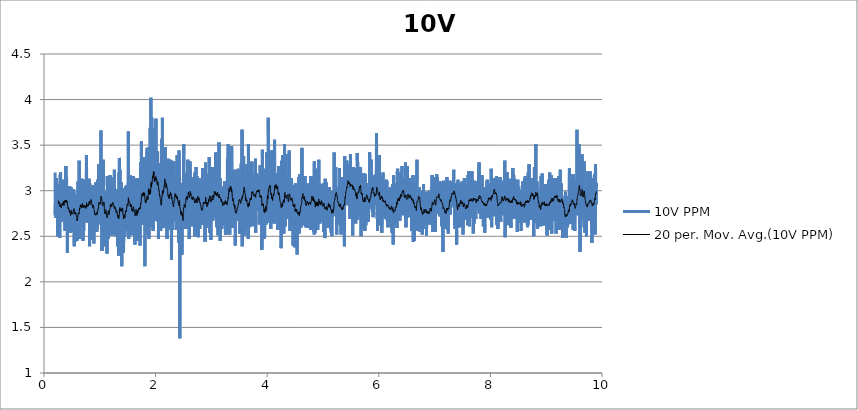
| Category | 10V PPM |
|---|---|
| 0.19886693011111112 | 3.2 |
| 0.20192682733333334 | 2.73 |
| 0.2049870023611111 | 2.91 |
| 0.20804745519444443 | 2.85 |
| 0.21110679683333333 | 2.85 |
| 0.21416724966666667 | 2.7 |
| 0.21722742469444445 | 3.07 |
| 0.22028732194444445 | 3.14 |
| 0.2233469413888889 | 2.85 |
| 0.22641044994444443 | 2.9 |
| 0.2294700693888889 | 2.89 |
| 0.23253246677777778 | 3.03 |
| 0.23559180841666666 | 3.03 |
| 0.23865226125 | 3 |
| 0.24171354744444443 | 2.76 |
| 0.24477511144444444 | 3.07 |
| 0.24783528647222222 | 2.5 |
| 0.2508951837222222 | 2.99 |
| 0.25395452536111107 | 2.68 |
| 0.2570135892222222 | 2.73 |
| 0.26007320866666667 | 2.61 |
| 0.2631325503333333 | 2.73 |
| 0.2661943921111111 | 2.82 |
| 0.2692537337777778 | 3.05 |
| 0.27231390880555556 | 2.73 |
| 0.27537352825 | 2.94 |
| 0.27843314769444444 | 2.87 |
| 0.2814924893333334 | 2.48 |
| 0.28455266438888893 | 2.74 |
| 0.2876125616111111 | 2.92 |
| 0.2906719032777778 | 3.18 |
| 0.2937318005 | 3 |
| 0.2967911421666667 | 3.2 |
| 0.29985048380555557 | 2.67 |
| 0.30291065883333335 | 2.74 |
| 0.30596972269444445 | 2.77 |
| 0.30902934213888894 | 2.83 |
| 0.31208951716666666 | 2.66 |
| 0.31514997 | 2.79 |
| 0.31820931163888894 | 2.99 |
| 0.32126948666666666 | 2.83 |
| 0.3243310506666667 | 3.05 |
| 0.32739039233333334 | 2.75 |
| 0.3304508451666667 | 2.71 |
| 0.33351018680555555 | 2.93 |
| 0.33657036183333333 | 2.84 |
| 0.33963025908333333 | 2.85 |
| 0.34269015630555555 | 2.78 |
| 0.3457494979722222 | 3.12 |
| 0.3488088396111111 | 2.97 |
| 0.3518684590555555 | 2.86 |
| 0.35493113425 | 2.68 |
| 0.3579918648611111 | 2.89 |
| 0.36105454002777776 | 3.06 |
| 0.3641138816944445 | 2.85 |
| 0.3671729455277778 | 3.01 |
| 0.37023423175 | 3.06 |
| 0.37329412897222225 | 2.85 |
| 0.3763543040277778 | 2.56 |
| 0.3794139234722222 | 2.93 |
| 0.3824732651111111 | 2.63 |
| 0.3855326067777778 | 3.07 |
| 0.3885922262222222 | 2.76 |
| 0.3916543458055555 | 3.27 |
| 0.3947172987777778 | 2.74 |
| 0.397777196 | 2.72 |
| 0.40083653766666666 | 2.72 |
| 0.40389671269444444 | 3.15 |
| 0.4069560543333333 | 2.76 |
| 0.41001595158333337 | 2.92 |
| 0.41307557102777775 | 2.76 |
| 0.4161349126666667 | 2.94 |
| 0.4191942543333333 | 2.32 |
| 0.42225359597222223 | 2.62 |
| 0.42531265983333333 | 2.74 |
| 0.4283728348611111 | 2.61 |
| 0.4314321765 | 3.01 |
| 0.4344929071388889 | 2.93 |
| 0.43755363774999995 | 2.69 |
| 0.44061325719444444 | 2.7 |
| 0.4436725988611111 | 2.79 |
| 0.4467333294722222 | 2.65 |
| 0.44979406008333334 | 2.7 |
| 0.45285673525 | 2.9 |
| 0.4559188548611111 | 2.67 |
| 0.45897847430555555 | 3.05 |
| 0.4620375381388889 | 2.64 |
| 0.4650977131944445 | 2.79 |
| 0.4681570548333333 | 2.66 |
| 0.4712166742777778 | 2.9 |
| 0.4742760159166667 | 2.54 |
| 0.47733702433333336 | 2.63 |
| 0.4803966437777778 | 2.91 |
| 0.4834557076388889 | 3.04 |
| 0.48651643827777774 | 2.82 |
| 0.48957605772222224 | 2.68 |
| 0.49263845508333337 | 2.57 |
| 0.49569779675000003 | 2.64 |
| 0.49875797177777775 | 2.61 |
| 0.501818424611111 | 2.94 |
| 0.5048774884444445 | 2.55 |
| 0.5079371078888889 | 2.85 |
| 0.5109967273333333 | 2.71 |
| 0.5140594025277777 | 2.84 |
| 0.5171195775555556 | 2.76 |
| 0.5201805859722223 | 2.94 |
| 0.5232404831944444 | 3.02 |
| 0.5263006582222222 | 2.73 |
| 0.5293650001666667 | 2.99 |
| 0.5324243418333333 | 2.75 |
| 0.5354839612777778 | 3 |
| 0.5385474698333333 | 2.67 |
| 0.5416334796666666 | 2.39 |
| 0.5446992105833334 | 2.7 |
| 0.5477854982222222 | 2.53 |
| 0.5508506735277778 | 2.81 |
| 0.5539430726388889 | 2.44 |
| 0.5570313048055556 | 2.83 |
| 0.5601245373055556 | 2.69 |
| 0.5631924905555555 | 2.68 |
| 0.5662665552777778 | 2.95 |
| 0.5693325639722222 | 2.76 |
| 0.5724041285277778 | 2.5 |
| 0.5755012501388889 | 2.55 |
| 0.5785925380555555 | 2.61 |
| 0.581674381 | 2.86 |
| 0.5847562239166666 | 2.67 |
| 0.5878377890833334 | 2.57 |
| 0.5909654679722222 | 2.45 |
| 0.5940453663333334 | 2.94 |
| 0.597158044388889 | 2.96 |
| 0.6002546103888888 | 2.64 |
| 0.6033367311111111 | 2.84 |
| 0.6063974617222222 | 2.88 |
| 0.6094598591111111 | 3.1 |
| 0.6125272567777778 | 2.81 |
| 0.6155924321111111 | 2.75 |
| 0.6186576074166666 | 2.77 |
| 0.6217266718611111 | 2.77 |
| 0.6248374053333334 | 2.78 |
| 0.6279003583055556 | 2.67 |
| 0.6309955353333333 | 3.33 |
| 0.6340801561944444 | 2.95 |
| 0.6371822780833333 | 2.47 |
| 0.6402649543888889 | 2.99 |
| 0.6433506864444444 | 2.69 |
| 0.6464211398333334 | 2.94 |
| 0.6494815926666667 | 2.99 |
| 0.6525448234444444 | 2.66 |
| 0.65563694475 | 2.63 |
| 0.6587329551388889 | 2.77 |
| 0.6618220207222223 | 3.02 |
| 0.664922753638889 | 2.83 |
| 0.6680304313888888 | 2.72 |
| 0.6711247750277778 | 2.75 |
| 0.6742055068055556 | 2.89 |
| 0.6773212405555556 | 2.85 |
| 0.6803928051388889 | 3.13 |
| 0.6834729813055554 | 2.94 |
| 0.6865473238333334 | 2.93 |
| 0.6896636131666667 | 2.76 |
| 0.6927585124166666 | 2.61 |
| 0.6958481335833334 | 2.75 |
| 0.6989230316666667 | 2.45 |
| 0.7020212644444443 | 2.9 |
| 0.7051172748611111 | 3.12 |
| 0.7082357865555555 | 3.07 |
| 0.7113220741944445 | 2.56 |
| 0.7144289185555556 | 2.88 |
| 0.717515484 | 2.73 |
| 0.720592326638889 | 2.82 |
| 0.7236666691388889 | 2.82 |
| 0.7267937924444444 | 2.72 |
| 0.7298784133333334 | 2.87 |
| 0.7329619230277777 | 3.02 |
| 0.7360540443333333 | 2.82 |
| 0.7391319981666667 | 2.7 |
| 0.7422268973888889 | 2.91 |
| 0.7453473536666667 | 2.78 |
| 0.7484591983055555 | 2.89 |
| 0.7515479860833333 | 2.69 |
| 0.75462010625 | 2.8 |
| 0.7576966711111112 | 2.73 |
| 0.7608229610277778 | 3.39 |
| 0.7639236939444445 | 3.05 |
| 0.7670022033611111 | 2.65 |
| 0.7701018250833334 | 2.7 |
| 0.773185057 | 2.8 |
| 0.7762805118333332 | 2.92 |
| 0.7793515208055556 | 2.67 |
| 0.7824464200555555 | 2.75 |
| 0.7855154844722222 | 2.74 |
| 0.7885989941666667 | 3.12 |
| 0.7917122278055556 | 2.78 |
| 0.7947790698888889 | 2.78 |
| 0.7978761914722222 | 3.02 |
| 0.8009730352777777 | 3.03 |
| 0.8040490445277778 | 2.75 |
| 0.8071425548055555 | 3.13 |
| 0.8102277312777778 | 3.05 |
| 0.8133287419722222 | 2.88 |
| 0.816398362 | 2.39 |
| 0.8195374304166666 | 3.08 |
| 0.8226112173333334 | 2.88 |
| 0.8257288956666666 | 2.86 |
| 0.8288093496388889 | 2.81 |
| 0.8318917481666667 | 2.82 |
| 0.8349780358055555 | 2.93 |
| 0.8380757129722223 | 3.04 |
| 0.8411572781111112 | 2.94 |
| 0.8442496772222222 | 2.94 |
| 0.8473142969444445 | 2.83 |
| 0.8504305863055556 | 2.67 |
| 0.8534943726388889 | 2.69 |
| 0.8565814936666667 | 2.46 |
| 0.859668336888889 | 2.85 |
| 0.8627351789722223 | 2.86 |
| 0.8658550796388889 | 2.8 |
| 0.8689772026666667 | 2.71 |
| 0.8720890473055556 | 2.84 |
| 0.8752347828055554 | 2.94 |
| 0.8783266263055556 | 2.89 |
| 0.8814123583611111 | 2.86 |
| 0.8845005905555556 | 3.06 |
| 0.8875957675833334 | 2.76 |
| 0.890686222111111 | 2.61 |
| 0.8938089007222223 | 2.42 |
| 0.8968807430833333 | 2.77 |
| 0.8999498075277778 | 2.83 |
| 0.9030394286944444 | 2.55 |
| 0.9061582181666666 | 2.67 |
| 0.9092264492222223 | 2.59 |
| 0.9123082921666668 | 2.58 |
| 0.9154143031388888 | 2.71 |
| 0.9184883678611111 | 2.58 |
| 0.9215885451944444 | 2.73 |
| 0.9246912226388888 | 2.81 |
| 0.9277980670277778 | 2.73 |
| 0.930886577 | 3.09 |
| 0.9339914768055555 | 3 |
| 0.9371174889444444 | 2.89 |
| 0.9402112770000001 | 2.95 |
| 0.9433014537500001 | 2.94 |
| 0.9463766296388889 | 2.55 |
| 0.9494776403611112 | 2.73 |
| 0.9525483715555556 | 2.58 |
| 0.955660494 | 2.77 |
| 0.9587395590000001 | 3.07 |
| 0.9618450143888889 | 2.83 |
| 0.9649507475833333 | 3.12 |
| 0.9680978720277779 | 2.63 |
| 0.9711733257222221 | 2.63 |
| 0.9742793366944444 | 3.03 |
| 0.9773822919722222 | 2.78 |
| 0.9804944144166667 | 3.29 |
| 0.9835754239722222 | 3 |
| 0.9866461551666666 | 2.78 |
| 0.9897507771666667 | 2.81 |
| 0.992830953361111 | 2.89 |
| 0.9959241858333333 | 2.89 |
| 0.9990243631388889 | 3.03 |
| 1.00214704175 | 2.85 |
| 1.0052249955833332 | 2.73 |
| 1.00830517175 | 2.94 |
| 1.0113995154166666 | 2.72 |
| 1.0144983037777777 | 2.86 |
| 1.017640705722222 | 3.27 |
| 1.0207289379166666 | 3.66 |
| 1.0238666173888888 | 2.81 |
| 1.0269320705 | 2.72 |
| 1.0300378036944444 | 2.67 |
| 1.033111035027778 | 2.59 |
| 1.0361870442777779 | 2.82 |
| 1.0392491638888888 | 2.34 |
| 1.0423451743055556 | 2.74 |
| 1.0454497963055556 | 2.81 |
| 1.0485480290833333 | 2.64 |
| 1.0516265384999999 | 2.91 |
| 1.0547056035 | 2.7 |
| 1.0577927245 | 3.13 |
| 1.0608792899444444 | 3.34 |
| 1.063965022 | 2.93 |
| 1.0670271415833332 | 2.88 |
| 1.0701225964166665 | 2.71 |
| 1.0732069394722223 | 3 |
| 1.0762746149444444 | 2.67 |
| 1.0793378457222222 | 2.69 |
| 1.0824399675833334 | 2.55 |
| 1.0855276441944444 | 2.57 |
| 1.0886089315277778 | 2.52 |
| 1.0916713289166666 | 2.39 |
| 1.0947462270277777 | 2.86 |
| 1.0978136246944443 | 2.64 |
| 1.1008932452777778 | 2.98 |
| 1.1039684211666667 | 2.87 |
| 1.1070508196944444 | 2.9 |
| 1.1101315514444443 | 2.52 |
| 1.1132233949722223 | 2.53 |
| 1.1163016265833334 | 2.66 |
| 1.119371246611111 | 2.73 |
| 1.1224542007222222 | 2.94 |
| 1.1255313211666667 | 2.98 |
| 1.12861094175 | 2.31 |
| 1.1316802839722222 | 2.84 |
| 1.1347565710277778 | 3.16 |
| 1.1378181350277776 | 2.89 |
| 1.140880254611111 | 2.86 |
| 1.1439593196111113 | 2.85 |
| 1.147035051111111 | 2.74 |
| 1.1501207831388889 | 2.87 |
| 1.1531845695 | 2.47 |
| 1.1562569674444445 | 2.68 |
| 1.1593379769999999 | 2.52 |
| 1.1624320428611112 | 2.8 |
| 1.1655238863888888 | 2.64 |
| 1.1686096184166668 | 2.77 |
| 1.1717100735555555 | 3.11 |
| 1.1747805269444445 | 2.92 |
| 1.1778790375 | 2.84 |
| 1.1809906043611111 | 2.7 |
| 1.1840630023055556 | 3.17 |
| 1.187181236222222 | 3.12 |
| 1.1902728019444446 | 3.09 |
| 1.193349922388889 | 2.77 |
| 1.1964442660277779 | 2.94 |
| 1.1995169417777778 | 3.01 |
| 1.202609340888889 | 2.89 |
| 1.205674794 | 2.62 |
| 1.2087869164444445 | 2.94 |
| 1.2118723706944443 | 2.51 |
| 1.2149878266666665 | 2.52 |
| 1.2180688362222223 | 2.85 |
| 1.221159846361111 | 3.02 |
| 1.2242277996111113 | 2.82 |
| 1.2273135316666668 | 2.64 |
| 1.230384540638889 | 3.01 |
| 1.2334727728333335 | 3 |
| 1.2365646163333335 | 2.59 |
| 1.2396409034166667 | 2.79 |
| 1.2427574705555555 | 2.79 |
| 1.2458301463055554 | 2.86 |
| 1.2489411575833334 | 3.03 |
| 1.2520318899166667 | 3.15 |
| 1.2551540129166667 | 2.59 |
| 1.2582291888333335 | 2.68 |
| 1.261331032888889 | 3.23 |
| 1.2644112090833333 | 2.88 |
| 1.2674958299444445 | 2.51 |
| 1.2705651721666666 | 2.52 |
| 1.2736620159722223 | 2.65 |
| 1.2767280246666666 | 2.75 |
| 1.2798040339444443 | 2.59 |
| 1.2829222678611112 | 2.61 |
| 1.2860082776944446 | 2.92 |
| 1.2890842869722223 | 2.73 |
| 1.2921594628611113 | 2.5 |
| 1.2952726964722223 | 2.83 |
| 1.298343149861111 | 2.69 |
| 1.3014672174444444 | 2.81 |
| 1.3045429489166667 | 3.02 |
| 1.3076245140833334 | 2.74 |
| 1.3107460815 | 2.88 |
| 1.3138470921944445 | 2.59 |
| 1.3169714375833335 | 2.66 |
| 1.320040502 | 2.39 |
| 1.3231429016666667 | 2.95 |
| 1.3262311338611112 | 2.78 |
| 1.3293377004444444 | 2.93 |
| 1.332435377611111 | 2.44 |
| 1.3355527781388887 | 2.65 |
| 1.3386176756666666 | 2.29 |
| 1.3417203531388888 | 2.46 |
| 1.344793584472222 | 3.2 |
| 1.3478798721111112 | 2.94 |
| 1.3509781048611111 | 3.36 |
| 1.3540666148611111 | 3.33 |
| 1.3571706812777777 | 2.67 |
| 1.3602366899722222 | 3.23 |
| 1.3633360339166665 | 2.59 |
| 1.3664256550833334 | 2.85 |
| 1.3694986086111112 | 2.68 |
| 1.3725937856666666 | 2.67 |
| 1.3756906294444444 | 2.43 |
| 1.3787710834166667 | 2.69 |
| 1.3818587600277779 | 2.79 |
| 1.3849650488055556 | 2.74 |
| 1.388047725138889 | 3.09 |
| 1.3911151228055556 | 2.66 |
| 1.394288359861111 | 2.17 |
| 1.3973793699722223 | 2.9 |
| 1.4004445453055556 | 2.47 |
| 1.4035316663055555 | 2.76 |
| 1.4066210096666667 | 3.03 |
| 1.4096884073611111 | 3 |
| 1.4127824731944445 | 2.84 |
| 1.4158532043888887 | 2.54 |
| 1.418921157638889 | 2.64 |
| 1.4220007782500002 | 2.92 |
| 1.425072065027778 | 2.32 |
| 1.4281464075277779 | 2.5 |
| 1.431253251888889 | 2.68 |
| 1.4343262054444443 | 2.86 |
| 1.4374024925000002 | 2.91 |
| 1.440478223972222 | 2.89 |
| 1.4435742343888889 | 2.85 |
| 1.4466644111388889 | 2.64 |
| 1.44974264275 | 2.5 |
| 1.452838375388889 | 2.96 |
| 1.455916607 | 2.96 |
| 1.4590467860277778 | 2.88 |
| 1.4621330736666667 | 2.68 |
| 1.465206305 | 3.03 |
| 1.4682934260277776 | 2.76 |
| 1.4713852695277778 | 3.05 |
| 1.4744832245000001 | 2.76 |
| 1.4775917356388888 | 2.93 |
| 1.4806799678333333 | 3.06 |
| 1.483746532111111 | 2.99 |
| 1.4868439315000002 | 3.02 |
| 1.4899341082500002 | 2.56 |
| 1.4930653984722222 | 2.77 |
| 1.4961619644722222 | 2.93 |
| 1.4992382515277778 | 2.66 |
| 1.5023100938888887 | 2.88 |
| 1.5054116601944445 | 2.76 |
| 1.5085021147222222 | 3.09 |
| 1.5115950694166669 | 3.65 |
| 1.5147141366944445 | 2.87 |
| 1.5178090359444445 | 2.47 |
| 1.5208731000833333 | 2.77 |
| 1.5239343862777777 | 2.75 |
| 1.5270276187777778 | 2.85 |
| 1.5301055725833335 | 2.6 |
| 1.5331907490555556 | 2.96 |
| 1.5362659249444444 | 2.8 |
| 1.5393522125833334 | 2.82 |
| 1.5424365556666668 | 2.75 |
| 1.5455278435833333 | 2.51 |
| 1.5486205204722223 | 3.17 |
| 1.5517145863333333 | 3.04 |
| 1.5547972626666668 | 2.64 |
| 1.557897717777778 | 2.78 |
| 1.5609987284722222 | 2.69 |
| 1.5641039060833333 | 2.87 |
| 1.5671899159166667 | 2.84 |
| 1.5702659251944444 | 2.85 |
| 1.5733561019444444 | 2.83 |
| 1.5764282220833332 | 2.59 |
| 1.5794978421111112 | 2.86 |
| 1.58257940725 | 2.67 |
| 1.5856448603611113 | 2.55 |
| 1.5887267033055557 | 2.63 |
| 1.5918143799166666 | 2.99 |
| 1.5949223354444444 | 3.12 |
| 1.5980005670833333 | 3.16 |
| 1.6011054668888889 | 2.94 |
| 1.604198699361111 | 2.62 |
| 1.6072860981666668 | 2.51 |
| 1.6103690522777778 | 2.64 |
| 1.6134550621388888 | 2.6 |
| 1.6165474612222221 | 2.87 |
| 1.6196565279444444 | 2.65 |
| 1.6227519827777777 | 2.64 |
| 1.6258838285833335 | 2.67 |
| 1.6290045626388887 | 2.41 |
| 1.6320983506944446 | 2.53 |
| 1.6352026949166667 | 3.01 |
| 1.6383017610555557 | 2.92 |
| 1.6414197171666667 | 3.14 |
| 1.6444871148333333 | 2.64 |
| 1.6475761804166666 | 2.76 |
| 1.6506596901111112 | 3.13 |
| 1.6537607008055557 | 2.56 |
| 1.6568328209722223 | 2.67 |
| 1.6599304981666667 | 2.67 |
| 1.6630278975277777 | 2.89 |
| 1.666146687027778 | 2.71 |
| 1.6692385305555555 | 2.55 |
| 1.672313428638889 | 3.14 |
| 1.6753886045277777 | 3.06 |
| 1.678481837 | 2.61 |
| 1.6815581240833333 | 2.45 |
| 1.68463830025 | 2.59 |
| 1.6877140317222223 | 2.85 |
| 1.69077892925 | 2.88 |
| 1.6938599388055557 | 2.92 |
| 1.6969259475 | 2.72 |
| 1.7000069570555554 | 3.02 |
| 1.7030707434166668 | 3.13 |
| 1.706159808972222 | 2.74 |
| 1.7092310957777777 | 2.96 |
| 1.7123112719444444 | 2.75 |
| 1.7153917259166667 | 2.91 |
| 1.7184599569722223 | 2.74 |
| 1.721522632138889 | 2.4 |
| 1.7245878074444443 | 3.01 |
| 1.7276524271944445 | 3.07 |
| 1.7307212138055554 | 3.31 |
| 1.733792778388889 | 3.14 |
| 1.7368604538611112 | 2.98 |
| 1.7399556308888888 | 2.92 |
| 1.7430208061944445 | 2.66 |
| 1.74610653825 | 3.54 |
| 1.7491969928055555 | 2.86 |
| 1.7522691129444443 | 3.17 |
| 1.7553515114722222 | 3.02 |
| 1.7584358545555556 | 3.12 |
| 1.7615124194166667 | 2.67 |
| 1.7645925955833335 | 2.88 |
| 1.7676633267777777 | 3.05 |
| 1.7707593371944443 | 2.75 |
| 1.7738392355833335 | 2.9 |
| 1.7769285789444444 | 2.63 |
| 1.7800070883611112 | 2.84 |
| 1.783071985888889 | 2.81 |
| 1.7861354944444443 | 3.37 |
| 1.7892012253611111 | 3.06 |
| 1.7922739010833333 | 2.68 |
| 1.7953504659444444 | 3.01 |
| 1.7984164746666667 | 2.93 |
| 1.8014963730277778 | 3.2 |
| 1.804564881888889 | 2.92 |
| 1.8076428356944443 | 2.17 |
| 1.8107169004166668 | 2.5 |
| 1.81378540925 | 3 |
| 1.8168614185277778 | 2.94 |
| 1.8199424280833334 | 2.99 |
| 1.823045383361111 | 2.66 |
| 1.8261122254166666 | 3.29 |
| 1.8291804564722223 | 3.28 |
| 1.8322798004166667 | 2.8 |
| 1.8353630323333332 | 2.52 |
| 1.8384720990277779 | 3.25 |
| 1.8415397745000002 | 2.69 |
| 1.8446002273333335 | 3.42 |
| 1.8476640136666667 | 3.47 |
| 1.8507525236666666 | 2.66 |
| 1.8538276995555556 | 2.63 |
| 1.856894541638889 | 3.07 |
| 1.8599713842777779 | 2.57 |
| 1.8630537828055556 | 3.31 |
| 1.8661431261666666 | 3.43 |
| 1.8692077459166667 | 2.93 |
| 1.8722773659166667 | 3.48 |
| 1.8753539307777778 | 2.97 |
| 1.8784602195555555 | 2.54 |
| 1.8815562299722224 | 2.47 |
| 1.8846269611666666 | 3.28 |
| 1.8877157489444443 | 2.74 |
| 1.8907931471944444 | 2.91 |
| 1.8938961024444443 | 3.1 |
| 1.897002669027778 | 2.6 |
| 1.90008951225 | 3.04 |
| 1.9031671882777779 | 3.69 |
| 1.9062429197500002 | 2.78 |
| 1.9093080950833334 | 3.21 |
| 1.9123896602222223 | 3.39 |
| 1.9154531687777778 | 4.02 |
| 1.9185450122777776 | 3.24 |
| 1.9216160212777778 | 2.82 |
| 1.9246953640555555 | 2.85 |
| 1.9277841518333334 | 2.72 |
| 1.9308807178333334 | 3.8 |
| 1.9339589494722222 | 3.38 |
| 1.9370544042777778 | 3 |
| 1.9401304135555557 | 2.98 |
| 1.943241702638889 | 3.24 |
| 1.9463266013055556 | 3.2 |
| 1.949412611138889 | 2.85 |
| 1.9524919539444443 | 3.38 |
| 1.9555671298333333 | 2.56 |
| 1.9586367498333335 | 3.68 |
| 1.9617166482222224 | 3.37 |
| 1.9647865460277778 | 2.88 |
| 1.967851999138889 | 3.48 |
| 1.970927175027778 | 3.26 |
| 1.9740087401666668 | 2.91 |
| 1.9770822493055558 | 2.69 |
| 1.9801527026944445 | 2.88 |
| 1.9832214893333333 | 3.14 |
| 1.9863250001944446 | 2.93 |
| 1.9894007316666666 | 3.19 |
| 1.9924734074166668 | 3.24 |
| 1.9955477499166667 | 3.38 |
| 1.9986232036111111 | 3.27 |
| 2.001713380361111 | 3.01 |
| 2.0048016125555557 | 3.79 |
| 2.0078862334166665 | 3.05 |
| 2.0109577979999997 | 2.67 |
| 2.0140332516666666 | 3.01 |
| 2.017102316111111 | 2.79 |
| 2.0202011044444443 | 3.4 |
| 2.023268502111111 | 2.73 |
| 2.026382569111111 | 3.03 |
| 2.0294613563333335 | 2.93 |
| 2.032544866027778 | 3.26 |
| 2.0356219864722225 | 3.43 |
| 2.038722719388889 | 2.88 |
| 2.0418051179166667 | 2.66 |
| 2.04487834925 | 3 |
| 2.0479404688333336 | 2.9 |
| 2.0510250896944444 | 2.47 |
| 2.0540958208888886 | 2.75 |
| 2.0571846086666667 | 3.22 |
| 2.0602761743888887 | 3.3 |
| 2.0633577395277776 | 2.68 |
| 2.0664345821944443 | 3.14 |
| 2.06950281325 | 2.71 |
| 2.072577989138889 | 2.87 |
| 2.0756414976944444 | 2.81 |
| 2.07873528575 | 2.72 |
| 2.081822128972222 | 2.71 |
| 2.0848859153333335 | 2.62 |
| 2.087960257833333 | 2.96 |
| 2.0910265443333333 | 2.56 |
| 2.094113943138889 | 3.26 |
| 2.097188007861111 | 2.71 |
| 2.1002873518055556 | 2.76 |
| 2.1033722504722223 | 2.89 |
| 2.1064477041388887 | 3.2 |
| 2.109523435611111 | 3.57 |
| 2.112586666388889 | 3.09 |
| 2.115672120638889 | 3.09 |
| 2.1187459075555557 | 3.2 |
| 2.121831639611111 | 3.8 |
| 2.1249045931388886 | 3.38 |
| 2.12798421375 | 2.59 |
| 2.1310621675555557 | 2.62 |
| 2.1341523443055554 | 2.76 |
| 2.137246687972222 | 3.2 |
| 2.140361032777778 | 2.91 |
| 2.143458987722222 | 2.59 |
| 2.146523051888889 | 3.14 |
| 2.149596283222222 | 3.33 |
| 2.1527070166944444 | 3.06 |
| 2.155771358638889 | 3.17 |
| 2.1588587574444444 | 3.41 |
| 2.161950045361111 | 3.1 |
| 2.16504744475 | 3.39 |
| 2.1681276209166667 | 2.8 |
| 2.1712241869166666 | 3.48 |
| 2.1742860287222223 | 2.93 |
| 2.1773712051944445 | 2.93 |
| 2.180441380777778 | 3.27 |
| 2.18352655725 | 2.82 |
| 2.1865986774166664 | 3.08 |
| 2.189699965888889 | 3.05 |
| 2.1927704193055555 | 2.68 |
| 2.195841428277778 | 3.19 |
| 2.1989235490277776 | 2.62 |
| 2.2020153925277777 | 2.68 |
| 2.205090290611111 | 2.47 |
| 2.208169633416667 | 3.12 |
| 2.2112439759166667 | 3.07 |
| 2.2143235965277777 | 3.01 |
| 2.2174043282777776 | 2.68 |
| 2.2204922826666667 | 2.61 |
| 2.2235616248888888 | 2.92 |
| 2.22664763475 | 3.35 |
| 2.2297317000277777 | 3.02 |
| 2.232809653861111 | 3.07 |
| 2.2358742735833332 | 3.02 |
| 2.238956672111111 | 2.95 |
| 2.2420221252222223 | 2.81 |
| 2.2450911896666668 | 2.98 |
| 2.2481580317222223 | 3.25 |
| 2.251232652027778 | 3.02 |
| 2.2543147727777777 | 3.34 |
| 2.25738105925 | 2.97 |
| 2.2604573463333333 | 2.87 |
| 2.2635302998611113 | 2.57 |
| 2.266604642361111 | 2.99 |
| 2.2696948191111113 | 3.04 |
| 2.2727724951666666 | 2.88 |
| 2.275835448111111 | 2.67 |
| 2.2789211801666664 | 2.74 |
| 2.2819846887222224 | 2.65 |
| 2.2850612535833332 | 2.24 |
| 2.2881322625833334 | 3.14 |
| 2.2911982712777776 | 3.33 |
| 2.294264002166667 | 2.77 |
| 2.2973625127222226 | 2.8 |
| 2.3004335217222223 | 2.76 |
| 2.3035148090833335 | 2.57 |
| 2.3066019300833336 | 2.7 |
| 2.309665994222222 | 3.08 |
| 2.3127342252777776 | 2.87 |
| 2.3158246798333333 | 2.92 |
| 2.3189101340833336 | 2.92 |
| 2.3219930881944446 | 2.85 |
| 2.3250635415833334 | 3.15 |
| 2.3281717749166666 | 3.14 |
| 2.3312350056944444 | 3.32 |
| 2.334300181 | 3.3 |
| 2.3373834129166666 | 2.67 |
| 2.3404744230277776 | 2.85 |
| 2.343560710666667 | 3.18 |
| 2.346642275833333 | 3 |
| 2.349716340527778 | 3.08 |
| 2.35279040525 | 2.78 |
| 2.3558747483333335 | 3.05 |
| 2.3589549245 | 2.78 |
| 2.362031489361111 | 2.72 |
| 2.365106109666667 | 2.66 |
| 2.3681748963055558 | 2.76 |
| 2.3712384048611113 | 2.57 |
| 2.374315803111111 | 2.74 |
| 2.3774045908888892 | 2.76 |
| 2.3804717107499997 | 3.15 |
| 2.383542441944445 | 2.67 |
| 2.3866098396111113 | 3.39 |
| 2.389689738 | 3.28 |
| 2.39279269325 | 3.08 |
| 2.395885092361111 | 2.73 |
| 2.398968046472222 | 2.57 |
| 2.4020598899722225 | 2.89 |
| 2.4051631230277777 | 2.7 |
| 2.4082296873055555 | 3.14 |
| 2.411326531111111 | 2.93 |
| 2.4144219859444447 | 2.43 |
| 2.4175196631111113 | 2.71 |
| 2.4205953945833336 | 3.44 |
| 2.423680848833333 | 2.66 |
| 2.4267610250277776 | 2.86 |
| 2.429846201472222 | 3.14 |
| 2.432918599444444 | 1.38 |
| 2.4360007201666667 | 2.57 |
| 2.439064506527778 | 2.46 |
| 2.4421369044722225 | 2.89 |
| 2.445218469611111 | 2.75 |
| 2.4482917009444445 | 2.67 |
| 2.451372432722222 | 2.84 |
| 2.4544587203333332 | 3.05 |
| 2.4575286181666667 | 2.82 |
| 2.4606421295833334 | 3.08 |
| 2.4637109162222224 | 2.68 |
| 2.466793314722222 | 2.95 |
| 2.4699079373333337 | 2.84 |
| 2.4729972806944445 | 2.3 |
| 2.476090235388889 | 2.71 |
| 2.4792006910555555 | 2.87 |
| 2.482281700611111 | 2.65 |
| 2.4853546541666667 | 2.58 |
| 2.488442052972222 | 2.78 |
| 2.491521673555556 | 2.62 |
| 2.4946196285277775 | 2.89 |
| 2.497694248833333 | 2.86 |
| 2.500762757666667 | 2.85 |
| 2.5038612682222223 | 3.51 |
| 2.5069294992777778 | 2.81 |
| 2.5099955079722225 | 2.98 |
| 2.513065128 | 3.14 |
| 2.516138914916667 | 2.97 |
| 2.5192340919444445 | 2.77 |
| 2.5223234353333335 | 2.75 |
| 2.5253983334166668 | 2.58 |
| 2.528473787111111 | 2.84 |
| 2.5315342399166667 | 3 |
| 2.5346016375833336 | 2.9 |
| 2.537677646861111 | 3.04 |
| 2.540761712138889 | 2.88 |
| 2.543851611111111 | 3.19 |
| 2.546930953888889 | 3.02 |
| 2.5500197416666666 | 2.73 |
| 2.5530957509444443 | 3.03 |
| 2.5561764827222224 | 2.85 |
| 2.559242769194445 | 2.58 |
| 2.5623162783333333 | 2.85 |
| 2.5653925653888887 | 3.13 |
| 2.568464963361111 | 3.15 |
| 2.5715548623055553 | 3.22 |
| 2.574622259972222 | 2.95 |
| 2.5777066030555553 | 3.34 |
| 2.5807845568888887 | 2.96 |
| 2.583858343805556 | 3.13 |
| 2.5869468537777776 | 2.88 |
| 2.5900125846944446 | 2.81 |
| 2.5931027614444444 | 2.68 |
| 2.5961809930555555 | 3 |
| 2.599263947166667 | 2.87 |
| 2.6023291224999996 | 2.47 |
| 2.605440133777778 | 3.02 |
| 2.6085105871666667 | 2.83 |
| 2.611595208027778 | 3.07 |
| 2.6146639946666665 | 3.15 |
| 2.617758616111111 | 3.32 |
| 2.6208379589166664 | 3.06 |
| 2.6239156349444444 | 2.78 |
| 2.627001367 | 2.88 |
| 2.6300893213888887 | 2.87 |
| 2.6331589414166667 | 2.95 |
| 2.6362530072777774 | 3.11 |
| 2.639313460111111 | 2.87 |
| 2.642395580833333 | 2.88 |
| 2.645461867333333 | 2.82 |
| 2.648534543083333 | 2.92 |
| 2.6516222196666663 | 2.61 |
| 2.6546837836666666 | 2.77 |
| 2.657769237944444 | 2.83 |
| 2.6608508030833335 | 2.86 |
| 2.663943479972222 | 2.9 |
| 2.6670233783611113 | 2.82 |
| 2.670114110694444 | 3.12 |
| 2.673199842722222 | 3.15 |
| 2.676292519638889 | 3.13 |
| 2.6793876966666668 | 2.96 |
| 2.6824753732777777 | 3.06 |
| 2.6855572161944443 | 2.83 |
| 2.688661838222222 | 2.63 |
| 2.6917753496388888 | 2.96 |
| 2.694850247722222 | 2.77 |
| 2.6979207011388886 | 2.5 |
| 2.700987821 | 3.09 |
| 2.7040607745555554 | 2.73 |
| 2.70714900675 | 3.2 |
| 2.710215293222222 | 2.51 |
| 2.713295747194444 | 2.81 |
| 2.716361755888889 | 2.78 |
| 2.719451099277778 | 2.97 |
| 2.7225284975000004 | 3.03 |
| 2.7256053401666667 | 3.26 |
| 2.7286766269444445 | 2.81 |
| 2.7317473581388887 | 2.83 |
| 2.73480808875 | 2.83 |
| 2.7379188222222224 | 2.8 |
| 2.741034833777778 | 3.16 |
| 2.7441433449166666 | 2.88 |
| 2.747219631972222 | 3.04 |
| 2.7502911965555557 | 3.04 |
| 2.7533897071111113 | 2.96 |
| 2.756494884722222 | 3.07 |
| 2.7596000623333334 | 3.01 |
| 2.762694405972222 | 2.49 |
| 2.765764303777778 | 2.91 |
| 2.7688450355555556 | 2.62 |
| 2.7719327121666666 | 2.93 |
| 2.7750340006388887 | 2.75 |
| 2.7781230662222223 | 2.86 |
| 2.7811943529999996 | 3.14 |
| 2.7842770293055557 | 2.7 |
| 2.7873616501944443 | 2.75 |
| 2.7904359926944444 | 2.58 |
| 2.7935606158611113 | 2.84 |
| 2.796669960388889 | 2.75 |
| 2.7997593037499997 | 2.96 |
| 2.802840591083333 | 2.72 |
| 2.8059238229999997 | 2.86 |
| 2.8090178888611113 | 2.88 |
| 2.8120822308055553 | 2.79 |
| 2.8151593512499997 | 2.71 |
| 2.8182378606666663 | 2.89 |
| 2.82132220375 | 2.73 |
| 2.824395990666667 | 2.71 |
| 2.827487556388889 | 2.73 |
| 2.830577455333333 | 2.63 |
| 2.833642352861111 | 2.67 |
| 2.8367197510833333 | 2.91 |
| 2.8398402073611115 | 2.88 |
| 2.842944273777778 | 3.25 |
| 2.846038895222222 | 3.03 |
| 2.8491129599444442 | 3.04 |
| 2.8522325828333335 | 2.96 |
| 2.855305536361111 | 2.87 |
| 2.85839349075 | 3.25 |
| 2.861468388861111 | 2.87 |
| 2.8645980123055557 | 2.65 |
| 2.867671243638889 | 2.63 |
| 2.8707528087777776 | 3.1 |
| 2.8738671535833333 | 2.94 |
| 2.8769628861944447 | 2.62 |
| 2.8800666748333335 | 2.76 |
| 2.88315462925 | 2.9 |
| 2.8862364721666665 | 2.44 |
| 2.88933026025 | 2.8 |
| 2.8924279374166666 | 2.95 |
| 2.895528948111111 | 3.31 |
| 2.898611902222222 | 3.26 |
| 2.901723191305556 | 2.7 |
| 2.9047947558611114 | 2.7 |
| 2.907884654833333 | 2.59 |
| 2.910947052194444 | 2.98 |
| 2.9140480629166667 | 2.63 |
| 2.917143795527778 | 2.82 |
| 2.9202231383333337 | 2.81 |
| 2.923334149611111 | 3.06 |
| 2.9264334935277776 | 3 |
| 2.9296003413333334 | 3.05 |
| 2.9326735726666664 | 2.92 |
| 2.935757360166667 | 2.64 |
| 2.9388847612777775 | 3.17 |
| 2.9419866053333332 | 2.64 |
| 2.9450806711944444 | 2.76 |
| 2.9481794595555555 | 2.94 |
| 2.951286026138889 | 3.19 |
| 2.9543725915555554 | 2.86 |
| 2.9574894365 | 2.96 |
| 2.9605829467777776 | 3.37 |
| 2.963699236138889 | 3.24 |
| 2.9667938575833332 | 2.86 |
| 2.969865144361111 | 2.98 |
| 2.972936431138889 | 2.54 |
| 2.9760171628888887 | 2.77 |
| 2.9790837271944444 | 2.61 |
| 2.9821630699722226 | 3.1 |
| 2.985249079805556 | 2.84 |
| 2.9883523128611107 | 2.68 |
| 2.9914224884722223 | 2.46 |
| 2.994539055611111 | 3.02 |
| 2.9976108979722222 | 3.02 |
| 3.0007027414999996 | 2.97 |
| 3.003789029138889 | 2.84 |
| 3.0068608715000003 | 3.05 |
| 3.009936602972222 | 3.19 |
| 3.0130248351666666 | 3.19 |
| 3.0161350130555555 | 3.26 |
| 3.0192338014166666 | 2.73 |
| 3.0223692585277777 | 3.2 |
| 3.025558885416667 | 2.67 |
| 3.028646006416667 | 2.95 |
| 3.0317181265833333 | 2.97 |
| 3.034796358194445 | 3.03 |
| 3.037865700416667 | 3.1 |
| 3.04094365425 | 2.7 |
| 3.044033553222222 | 2.78 |
| 3.0471345639166665 | 2.9 |
| 3.0502722433888887 | 3.21 |
| 3.053368809388889 | 3.08 |
| 3.0564948215 | 2.74 |
| 3.059591109722222 | 3.04 |
| 3.0626548960555557 | 2.8 |
| 3.065742294888889 | 3.12 |
| 3.0688274713333334 | 3.1 |
| 3.0718912576944444 | 2.73 |
| 3.0749694893055555 | 2.96 |
| 3.0780560547499998 | 3.42 |
| 3.0811492872222224 | 2.97 |
| 3.084241130722222 | 2.96 |
| 3.087318251166667 | 2.72 |
| 3.090425928916667 | 3.07 |
| 3.093496660111111 | 2.94 |
| 3.09656378 | 2.6 |
| 3.099644233972222 | 2.97 |
| 3.10274107775 | 2.97 |
| 3.105811253361111 | 3.24 |
| 3.1089111528888886 | 2.95 |
| 3.1119921624444444 | 3.31 |
| 3.115104840472222 | 2.62 |
| 3.1181805719444444 | 2.51 |
| 3.1212726932500003 | 3.08 |
| 3.1243464801666665 | 2.66 |
| 3.1274358235555555 | 2.81 |
| 3.130520722222222 | 3.01 |
| 3.1336175660000003 | 2.84 |
| 3.136706076 | 3.53 |
| 3.1398034753888893 | 3.11 |
| 3.1428789290555557 | 3 |
| 3.145951327027778 | 2.57 |
| 3.1490434483333334 | 2.86 |
| 3.152145014611111 | 2.84 |
| 3.1552529701388887 | 3.14 |
| 3.15831842325 | 2.45 |
| 3.161407766638889 | 2.85 |
| 3.164489609555556 | 2.94 |
| 3.167558951777778 | 2.92 |
| 3.170647739583333 | 2.87 |
| 3.173724304416667 | 3.01 |
| 3.1767944800277776 | 2.66 |
| 3.1799032689444444 | 2.96 |
| 3.1829837229166666 | 2.69 |
| 3.186068066 | 2.58 |
| 3.189137686027778 | 2.84 |
| 3.1922309185 | 3.05 |
| 3.195312205861111 | 2.62 |
| 3.198381270277778 | 3.03 |
| 3.201471447027778 | 2.89 |
| 3.2045469007222223 | 2.92 |
| 3.207630688194444 | 2.8 |
| 3.2107391993333336 | 3.02 |
| 3.213811041694444 | 2.94 |
| 3.2168970515555557 | 2.99 |
| 3.2199691716944447 | 2.84 |
| 3.2230485145000003 | 2.62 |
| 3.2261200790833335 | 2.93 |
| 3.229271926027778 | 2.92 |
| 3.2323434905833333 | 2.89 |
| 3.2354408899722222 | 2.77 |
| 3.2385077320555555 | 3.1 |
| 3.241600131138889 | 3.02 |
| 3.2446983639166667 | 2.89 |
| 3.247785762722222 | 2.74 |
| 3.2508778840277777 | 2.52 |
| 3.2539802836944443 | 2.71 |
| 3.257065182361111 | 3.02 |
| 3.2601675820277776 | 2.83 |
| 3.263269703916667 | 3.08 |
| 3.266339601722222 | 2.98 |
| 3.269411721888889 | 2.52 |
| 3.272492453638889 | 2.89 |
| 3.275603187111111 | 2.78 |
| 3.278714198388889 | 2.85 |
| 3.281791041055556 | 2.86 |
| 3.2849256647777776 | 2.8 |
| 3.2880233419722225 | 3.35 |
| 3.291133242055556 | 2.96 |
| 3.2942206408611114 | 3.15 |
| 3.297314984527778 | 3.14 |
| 3.3004162730277775 | 3.51 |
| 3.3035270065 | 2.77 |
| 3.306631072916667 | 3.34 |
| 3.30974875125 | 3.21 |
| 3.312843372694444 | 3.37 |
| 3.315993552888889 | 3.07 |
| 3.3191248430833338 | 2.7 |
| 3.3221944631111113 | 2.94 |
| 3.3253068633333336 | 3.03 |
| 3.3283762055555552 | 2.52 |
| 3.3314458255833332 | 2.89 |
| 3.33451794575 | 3.33 |
| 3.33760173325 | 2.8 |
| 3.3406763535277775 | 3.29 |
| 3.343762085583333 | 2.67 |
| 3.3468289276666665 | 2.69 |
| 3.3499079926666666 | 3.09 |
| 3.3529778904722223 | 3.27 |
| 3.3560477883055557 | 2.74 |
| 3.359113797 | 2.63 |
| 3.362215085472222 | 3.49 |
| 3.365298317388889 | 3.23 |
| 3.3683712709444444 | 2.77 |
| 3.371447558 | 2.71 |
| 3.374516066833333 | 2.59 |
| 3.3775937428611114 | 2.81 |
| 3.3806780859444445 | 2.83 |
| 3.3837838191388885 | 2.7 |
| 3.386858161666667 | 2.68 |
| 3.3899397268055553 | 3.03 |
| 3.3930165694444447 | 2.59 |
| 3.396097579 | 2.89 |
| 3.3991755328333335 | 2.74 |
| 3.402255431222222 | 2.67 |
| 3.4053394965000003 | 2.61 |
| 3.408452730138889 | 2.85 |
| 3.4115204055833335 | 2.94 |
| 3.4146197495277777 | 2.72 |
| 3.4176965921666667 | 2.71 |
| 3.4207623230833333 | 3.23 |
| 3.4238319431111113 | 2.98 |
| 3.4269448989166666 | 2.4 |
| 3.4300497987500003 | 2.53 |
| 3.4331208077222226 | 2.66 |
| 3.43619042775 | 2.74 |
| 3.439278104361111 | 2.68 |
| 3.4423752259444442 | 2.71 |
| 3.4454592912222224 | 2.99 |
| 3.4485300224166666 | 2.79 |
| 3.451597697888889 | 2.99 |
| 3.454661484222222 | 2.97 |
| 3.457763883888889 | 2.8 |
| 3.4608373930277776 | 2.79 |
| 3.463913957888889 | 3.14 |
| 3.4670016345000003 | 2.67 |
| 3.470066532 | 2.8 |
| 3.4731503195 | 3.1 |
| 3.476217439388889 | 2.84 |
| 3.479299004527778 | 3.21 |
| 3.482365846611111 | 3.24 |
| 3.4854312997222223 | 2.93 |
| 3.4885078645833336 | 3.02 |
| 3.4915947078055556 | 2.73 |
| 3.4946637722222222 | 2.83 |
| 3.497750059861111 | 2.76 |
| 3.5008110682777773 | 2.73 |
| 3.5039006894444444 | 2.85 |
| 3.5069853103055553 | 2.84 |
| 3.5100702089722224 | 2.53 |
| 3.513152051916667 | 2.74 |
| 3.5162236164999996 | 2.99 |
| 3.5193026815 | 2.76 |
| 3.5223664678333333 | 2.87 |
| 3.52544497725 | 2.78 |
| 3.528513486111111 | 2.9 |
| 3.5315858840555556 | 3.24 |
| 3.5346546706944446 | 3.3 |
| 3.537718734833333 | 2.77 |
| 3.5407889104444443 | 3.05 |
| 3.5438554747222226 | 3.25 |
| 3.546928150472222 | 3.09 |
| 3.5500030485555554 | 3.67 |
| 3.5530662793333336 | 2.39 |
| 3.556141733 | 2.87 |
| 3.5592210758055556 | 3.21 |
| 3.562284862166667 | 2.91 |
| 3.5653711498055554 | 2.86 |
| 3.568439103055556 | 2.81 |
| 3.5715087230555556 | 2.99 |
| 3.5745919549722225 | 3.02 |
| 3.5776674086666667 | 3.38 |
| 3.5807523073333334 | 2.88 |
| 3.5838458175833336 | 3.08 |
| 3.5869757188333335 | 3.12 |
| 3.590062562055556 | 2.81 |
| 3.593176629055556 | 2.86 |
| 3.5962470824722224 | 2.94 |
| 3.5993267030555556 | 2.51 |
| 3.6023929895555558 | 2.8 |
| 3.60548455525 | 3.08 |
| 3.6085516751388886 | 2.6 |
| 3.611647963333333 | 2.67 |
| 3.6147448071388886 | 3 |
| 3.61784526225 | 2.93 |
| 3.620922104888889 | 2.63 |
| 3.62399866975 | 2.81 |
| 3.627078568138889 | 2.91 |
| 3.6301420766944448 | 2.78 |
| 3.633214196861111 | 2.93 |
| 3.6362843724722222 | 3.29 |
| 3.6393559370277777 | 2.71 |
| 3.64244278025 | 2.83 |
| 3.645517956138889 | 2.91 |
| 3.6485959099722223 | 2.75 |
| 3.6516669189722224 | 2.99 |
| 3.6548029316666666 | 2.6 |
| 3.6578831078333334 | 2.73 |
| 3.6610085643888888 | 2.47 |
| 3.6640937408333336 | 3.51 |
| 3.6672030853611113 | 2.94 |
| 3.67026548275 | 2.7 |
| 3.6733434365555553 | 2.94 |
| 3.6764194458333335 | 2.6 |
| 3.679506289055556 | 2.67 |
| 3.6825775758333332 | 3.12 |
| 3.6856624745 | 3.24 |
| 3.6887720968055557 | 2.94 |
| 3.6918356053611108 | 3.15 |
| 3.6949063365555554 | 3.29 |
| 3.6979773455555556 | 2.88 |
| 3.701061688611111 | 2.93 |
| 3.704155754472222 | 2.87 |
| 3.7072359306666667 | 2.98 |
| 3.710329163138889 | 2.82 |
| 3.7133973941944447 | 2.65 |
| 3.7164717366944444 | 2.99 |
| 3.7195405233333334 | 3.16 |
| 3.722614588055556 | 3.18 |
| 3.7256825413055554 | 3.32 |
| 3.7287588283611113 | 3.17 |
| 3.731824559277778 | 2.87 |
| 3.734889734583333 | 2.61 |
| 3.7379685218055556 | 2.86 |
| 3.7410367528333333 | 2.78 |
| 3.7441183180000004 | 2.92 |
| 3.747195994027778 | 3.05 |
| 3.750268391972222 | 2.98 |
| 3.753343567861111 | 3.05 |
| 3.7564379115277777 | 2.91 |
| 3.7595130874166665 | 2.72 |
| 3.7625813184444445 | 2.89 |
| 3.7656484383333333 | 2.9 |
| 3.7687261143611113 | 3.17 |
| 3.7718024014166667 | 2.91 |
| 3.7748720214444442 | 2.83 |
| 3.7779391413055556 | 2.98 |
| 3.781004872222222 | 2.98 |
| 3.784076992388889 | 3.19 |
| 3.787140778722222 | 2.92 |
| 3.7902045650833336 | 3.35 |
| 3.7932747406944443 | 2.54 |
| 3.796367973166667 | 3.19 |
| 3.7994398155277778 | 2.93 |
| 3.8025183249444443 | 3.15 |
| 3.8055954453888887 | 3.04 |
| 3.8086661765833334 | 3.19 |
| 3.8117616314166667 | 3.08 |
| 3.814842640972222 | 2.8 |
| 3.817960319277778 | 3 |
| 3.821069386 | 2.94 |
| 3.824158729361111 | 2.88 |
| 3.8272427946666667 | 3.05 |
| 3.830320192888889 | 2.78 |
| 3.833405369361111 | 2.92 |
| 3.83649804625 | 3.06 |
| 3.8395687774444442 | 3 |
| 3.8426445089166665 | 3.17 |
| 3.8457107954166667 | 2.98 |
| 3.8487959718888884 | 2.87 |
| 3.8519008716944443 | 3.13 |
| 3.854967435972222 | 3.04 |
| 3.8580453898055556 | 2.63 |
| 3.8611639015000003 | 2.8 |
| 3.864248522388889 | 2.95 |
| 3.867315086666667 | 2.64 |
| 3.8703780396388887 | 2.88 |
| 3.873440437027778 | 3.28 |
| 3.8765283914166666 | 2.91 |
| 3.8796119011111108 | 2.78 |
| 3.882676798638889 | 3.03 |
| 3.8857469742500004 | 2.85 |
| 3.8888207611666665 | 2.72 |
| 3.8918903811666667 | 3.02 |
| 3.8949750020555554 | 3.14 |
| 3.898060734111111 | 2.6 |
| 3.9011350766111113 | 2.62 |
| 3.9042155305833335 | 2.35 |
| 3.907290984277778 | 2.52 |
| 3.9103694936666664 | 2.76 |
| 3.913445225166667 | 3.45 |
| 3.9165265125 | 3.09 |
| 3.919614189111111 | 2.75 |
| 3.922691865138889 | 2.83 |
| 3.92577481925 | 2.78 |
| 3.928883330388889 | 2.75 |
| 3.9319507280555555 | 2.63 |
| 3.935042571555556 | 2.67 |
| 3.9381263590555555 | 2.72 |
| 3.9412054240555556 | 2.47 |
| 3.9442925450833335 | 2.61 |
| 3.9473624428888887 | 3.24 |
| 3.950429840555555 | 2.98 |
| 3.9535052942499997 | 2.49 |
| 3.956571580722222 | 2.83 |
| 3.9596520346944444 | 3.03 |
| 3.9627263772222223 | 2.79 |
| 3.965788774583334 | 2.91 |
| 3.9688589501944445 | 2.66 |
| 3.971937737416667 | 2.94 |
| 3.975004023888889 | 2.82 |
| 3.9780961451944443 | 2.63 |
| 3.9811635428611107 | 2.73 |
| 3.9842287181944442 | 2.85 |
| 3.9872958380555557 | 2.96 |
| 3.990371013944445 | 3.01 |
| 3.993448967777778 | 3.42 |
| 3.9965213657222223 | 3.18 |
| 3.9995970971944446 | 3.25 |
| 4.0026708841388885 | 3.16 |
| 4.005774394972222 | 3.11 |
| 4.008851237611111 | 2.72 |
| 4.01192002425 | 2.66 |
| 4.014988255305556 | 2.76 |
| 4.018056208555556 | 3.8 |
| 4.021153330138889 | 3.61 |
| 4.024235450888889 | 3.05 |
| 4.027301737388889 | 2.65 |
| 4.030378302222222 | 3.08 |
| 4.033461811944444 | 3.18 |
| 4.036545599416667 | 2.76 |
| 4.039617719583333 | 3.02 |
| 4.042700118111111 | 2.75 |
| 4.045765849027778 | 2.92 |
| 4.048882138361111 | 2.87 |
| 4.051964814694444 | 3.3 |
| 4.05505860275 | 3.04 |
| 4.058127667194444 | 2.73 |
| 4.061208676750001 | 2.88 |
| 4.064296908944444 | 2.58 |
| 4.067385141138889 | 2.72 |
| 4.070457261277777 | 2.9 |
| 4.073529103666666 | 2.65 |
| 4.076602612777777 | 2.89 |
| 4.079673899555556 | 2.79 |
| 4.082742686194444 | 3.44 |
| 4.0858070281388885 | 3.12 |
| 4.088886370916667 | 2.97 |
| 4.09195960225 | 2.76 |
| 4.095030333444445 | 2.8 |
| 4.098103009194444 | 2.77 |
| 4.1011917969722225 | 3.35 |
| 4.104266972861111 | 3.38 |
| 4.107350760361111 | 3.03 |
| 4.1104364924166665 | 3.22 |
| 4.11351444625 | 2.85 |
| 4.116574899055555 | 3.1 |
| 4.119678132111111 | 2.87 |
| 4.122749974472223 | 3.21 |
| 4.1258501518055555 | 2.64 |
| 4.128923383138889 | 3.39 |
| 4.132016893416667 | 3.56 |
| 4.135086235638889 | 3 |
| 4.138161411527777 | 2.76 |
| 4.141232142722222 | 2.85 |
| 4.144313985638889 | 3.08 |
| 4.1473824944999995 | 2.97 |
| 4.150457948166667 | 2.89 |
| 4.153561181222223 | 3.13 |
| 4.156695249361111 | 2.92 |
| 4.159768480694445 | 3.18 |
| 4.162868935833333 | 3.05 |
| 4.165947723027778 | 3.13 |
| 4.169025954638889 | 3.09 |
| 4.172107242 | 2.77 |
| 4.175180751138889 | 2.9 |
| 4.178252871277778 | 3.09 |
| 4.181335547611111 | 3.19 |
| 4.184404612027778 | 3.03 |
| 4.187481176888888 | 2.98 |
| 4.190554963805556 | 2.57 |
| 4.193638473527778 | 2.84 |
| 4.196713093805555 | 2.88 |
| 4.199821604944445 | 2.59 |
| 4.20289150275 | 3.27 |
| 4.205967789833333 | 3 |
| 4.2090476881944445 | 2.71 |
| 4.212122030722222 | 3.25 |
| 4.215207207166666 | 2.82 |
| 4.218289605694444 | 2.73 |
| 4.221371170833334 | 2.81 |
| 4.224489960333333 | 2.66 |
| 4.227564580638889 | 2.75 |
| 4.230648645944445 | 2.81 |
| 4.233725766388889 | 2.63 |
| 4.2368131651944445 | 2.81 |
| 4.239891952388889 | 3.03 |
| 4.242960739027778 | 3 |
| 4.246073694861111 | 2.8 |
| 4.2491544266388885 | 2.37 |
| 4.252225991194445 | 2.67 |
| 4.255292833277778 | 2.86 |
| 4.258398566472222 | 3.33 |
| 4.261491798944444 | 2.83 |
| 4.264600865666667 | 2.86 |
| 4.267672708027778 | 2.78 |
| 4.2707484395 | 2.69 |
| 4.273839449638889 | 3.28 |
| 4.276915736694445 | 3.39 |
| 4.280005913444445 | 3.14 |
| 4.283076089055555 | 2.7 |
| 4.286185711361111 | 2.99 |
| 4.289260053861112 | 2.82 |
| 4.292329673888889 | 2.98 |
| 4.295418739472223 | 2.66 |
| 4.298510027388889 | 2.53 |
| 4.301575202694444 | 2.87 |
| 4.3046762133888885 | 2.85 |
| 4.307768890305556 | 3.12 |
| 4.310874067888889 | 3.51 |
| 4.313957577611111 | 3.23 |
| 4.317049698888889 | 3.07 |
| 4.320120430083334 | 2.93 |
| 4.323193661416666 | 2.61 |
| 4.326268559527778 | 2.62 |
| 4.329333457055555 | 2.78 |
| 4.332395854416666 | 2.75 |
| 4.335459640777778 | 3.4 |
| 4.338528983 | 2.74 |
| 4.341608047999999 | 3.1 |
| 4.34467600125 | 2.76 |
| 4.347758677583333 | 3.08 |
| 4.350844965222222 | 3.07 |
| 4.353934864166667 | 3.07 |
| 4.357016429305555 | 2.69 |
| 4.360081882416667 | 2.74 |
| 4.363161225222222 | 2.76 |
| 4.366235289944445 | 3.08 |
| 4.369343523277777 | 2.78 |
| 4.372439533694444 | 2.97 |
| 4.3755174875 | 2.8 |
| 4.378607942055556 | 2.94 |
| 4.381703119083333 | 2.85 |
| 4.384808018888889 | 3.01 |
| 4.387908196222223 | 2.95 |
| 4.391013373833333 | 3.07 |
| 4.394103272777778 | 3.44 |
| 4.397199838777778 | 3.11 |
| 4.400294738027778 | 2.97 |
| 4.403372691861112 | 2.91 |
| 4.406445089805556 | 2.56 |
| 4.409569157388889 | 2.79 |
| 4.412649333555556 | 2.96 |
| 4.4157500664722225 | 2.68 |
| 4.418824131166667 | 2.74 |
| 4.421929031 | 2.77 |
| 4.425019485527778 | 2.65 |
| 4.428131052388888 | 2.89 |
| 4.431215673277777 | 2.81 |
| 4.434305016638889 | 3.14 |
| 4.43740074925 | 3.1 |
| 4.440483425583333 | 3.03 |
| 4.443562768361111 | 2.64 |
| 4.446633777361111 | 3.02 |
| 4.449700341638889 | 2.69 |
| 4.4527852403055554 | 3 |
| 4.455900140694444 | 3.05 |
| 4.459006151666667 | 2.84 |
| 4.462071326999999 | 2.88 |
| 4.465170948722222 | 2.4 |
| 4.468255569611111 | 2.79 |
| 4.471341579444444 | 2.46 |
| 4.474427033694444 | 2.88 |
| 4.47751276575 | 2.67 |
| 4.480592386333333 | 2.78 |
| 4.48366617325 | 3 |
| 4.486778295722222 | 2.91 |
| 4.489850138083334 | 2.65 |
| 4.492916702361111 | 3.06 |
| 4.495999934277777 | 2.38 |
| 4.499122335083333 | 2.9 |
| 4.502216956527778 | 2.47 |
| 4.505281298472222 | 3.08 |
| 4.508361752444444 | 2.89 |
| 4.511448040083333 | 2.91 |
| 4.514540439166667 | 2.71 |
| 4.517621448722222 | 2.8 |
| 4.520717459138889 | 2.75 |
| 4.523822358944444 | 2.87 |
| 4.526891145583333 | 2.79 |
| 4.529991045111111 | 2.8 |
| 4.533070665694444 | 2.59 |
| 4.536177787861111 | 2.3 |
| 4.539269075777778 | 2.64 |
| 4.542368141944444 | 2.59 |
| 4.545456651916666 | 2.86 |
| 4.548547939833333 | 2.83 |
| 4.55162644925 | 2.8 |
| 4.554706903222223 | 2.89 |
| 4.557802635861111 | 2.77 |
| 4.560863366472222 | 2.62 |
| 4.563929097361111 | 2.69 |
| 4.567001495333333 | 3.15 |
| 4.5700811159166665 | 2.55 |
| 4.573164070027778 | 2.53 |
| 4.576255635750001 | 2.76 |
| 4.579349423805556 | 3.09 |
| 4.582433766888889 | 3.18 |
| 4.585540889055555 | 2.9 |
| 4.588625787722222 | 2.64 |
| 4.591704574916666 | 3.11 |
| 4.594776417305556 | 3.06 |
| 4.59785353775 | 2.87 |
| 4.60094454786111 | 2.66 |
| 4.60406417075 | 2.59 |
| 4.607156569833333 | 3.07 |
| 4.610228412222223 | 2.9 |
| 4.6133363677500006 | 3.04 |
| 4.616421822 | 3.02 |
| 4.619492553194444 | 2.98 |
| 4.622556617333333 | 3.47 |
| 4.625655127888889 | 3.08 |
| 4.628750304944444 | 2.97 |
| 4.631817980388889 | 2.67 |
| 4.634933714166666 | 2.95 |
| 4.638003889777778 | 3.13 |
| 4.641126012777778 | 2.99 |
| 4.644195910583333 | 2.69 |
| 4.647266364 | 2.82 |
| 4.650355985138888 | 2.62 |
| 4.653427549722222 | 2.99 |
| 4.656502447833333 | 2.63 |
| 4.659562067277778 | 3.07 |
| 4.66265529975 | 2.84 |
| 4.66572964225 | 2.83 |
| 4.668803706972223 | 2.79 |
| 4.671882216388888 | 2.66 |
| 4.6750387858055555 | 2.65 |
| 4.678162575611111 | 3.16 |
| 4.681306366527778 | 2.97 |
| 4.684404877083333 | 2.83 |
| 4.687510332472223 | 2.79 |
| 4.690622454916666 | 3 |
| 4.693687908027778 | 2.6 |
| 4.696789752111111 | 2.83 |
| 4.6998629834444445 | 2.94 |
| 4.702967605472222 | 3.02 |
| 4.706060004583334 | 2.96 |
| 4.709192128166667 | 3.07 |
| 4.712270637583333 | 2.98 |
| 4.715343035527778 | 2.89 |
| 4.718431545527777 | 2.83 |
| 4.7215014433333335 | 2.84 |
| 4.724598287138889 | 2.65 |
| 4.727715132055556 | 2.97 |
| 4.730779196222222 | 2.59 |
| 4.733858816805555 | 2.78 |
| 4.7369287146111105 | 2.61 |
| 4.74000555725 | 2.7 |
| 4.743075455083333 | 3.08 |
| 4.746176187972223 | 2.85 |
| 4.749247752555556 | 2.97 |
| 4.752375431444444 | 3.05 |
| 4.755471441861111 | 2.78 |
| 4.758538283944445 | 2.89 |
| 4.761636238916666 | 2.81 |
| 4.764740027555556 | 3.08 |
| 4.7678185369722215 | 3.08 |
| 4.7708831566944445 | 3.03 |
| 4.773944442888889 | 2.79 |
| 4.777020452166667 | 2.57 |
| 4.780102295111111 | 3.16 |
| 4.783199138888889 | 2.92 |
| 4.786273759194444 | 2.86 |
| 4.7893781034166665 | 3.09 |
| 4.792480503111111 | 2.65 |
| 4.795574013361111 | 3.13 |
| 4.798654467333334 | 3.05 |
| 4.801767423166667 | 2.98 |
| 4.804857599916667 | 2.58 |
| 4.807925275388889 | 2.72 |
| 4.810994895388889 | 2.83 |
| 4.814085627722223 | 2.84 |
| 4.817161359194444 | 3.05 |
| 4.820247924638888 | 3.11 |
| 4.823317266861111 | 3.15 |
| 4.826383553361111 | 2.88 |
| 4.8294842862500005 | 2.55 |
| 4.832584463583333 | 2.91 |
| 4.835725476583334 | 2.97 |
| 4.838792596444445 | 2.74 |
| 4.841892218166667 | 2.52 |
| 4.844986561833334 | 3.32 |
| 4.848060070944445 | 2.68 |
| 4.8511363580277775 | 2.74 |
| 4.854226534777778 | 2.77 |
| 4.85731754488889 | 2.91 |
| 4.860414110888889 | 2.54 |
| 4.863503176472222 | 2.59 |
| 4.866575574416666 | 3.24 |
| 4.86966630675 | 3.23 |
| 4.872739815888889 | 2.89 |
| 4.875821103250001 | 2.78 |
| 4.878889889888889 | 3.06 |
| 4.882007012611111 | 2.93 |
| 4.885075799250001 | 2.61 |
| 4.888171809666667 | 2.72 |
| 4.891253097 | 3.02 |
| 4.894331606416667 | 2.9 |
| 4.897399837472222 | 2.85 |
| 4.900473346611111 | 3.11 |
| 4.903539910888889 | 2.57 |
| 4.906605919583333 | 2.58 |
| 4.909718597611111 | 2.65 |
| 4.912802385111111 | 2.67 |
| 4.9159617325 | 3.24 |
| 4.919043575416667 | 2.79 |
| 4.922170698722223 | 2.98 |
| 4.92523559625 | 3.34 |
| 4.928354941333334 | 2.75 |
| 4.931446784861111 | 2.93 |
| 4.934516682666667 | 3.08 |
| 4.937596025444444 | 2.81 |
| 4.940658700638889 | 2.76 |
| 4.943753044277777 | 2.64 |
| 4.946834053833333 | 2.99 |
| 4.949948676416667 | 2.87 |
| 4.953013018361111 | 2.79 |
| 4.956085416333333 | 2.81 |
| 4.959159758833334 | 2.75 |
| 4.962244657499999 | 2.85 |
| 4.965326222638889 | 3.02 |
| 4.968417232777778 | 2.96 |
| 4.971485186027778 | 2.79 |
| 4.974580085277777 | 2.69 |
| 4.977648038527778 | 2.79 |
| 4.98072377 | 2.74 |
| 4.983830892166666 | 3.07 |
| 4.986947459305555 | 2.92 |
| 4.990058748361111 | 2.66 |
| 4.993126423833333 | 2.84 |
| 4.996225212194444 | 2.81 |
| 4.999289276333333 | 2.76 |
| 5.002387509083333 | 2.95 |
| 5.005482963916666 | 3.08 |
| 5.008580918888889 | 3.06 |
| 5.011650261111111 | 2.55 |
| 5.0147257148055555 | 2.8 |
| 5.017804224222222 | 3.08 |
| 5.020955237777778 | 2.56 |
| 5.024028746888889 | 2.66 |
| 5.0271178124722224 | 2.8 |
| 5.030192988361111 | 2.79 |
| 5.033278164833334 | 2.48 |
| 5.036344451305555 | 2.58 |
| 5.039422682944444 | 3.13 |
| 5.042490636194444 | 2.69 |
| 5.045557756055556 | 2.99 |
| 5.048633765333333 | 2.79 |
| 5.051724497666666 | 2.86 |
| 5.054799673555555 | 2.75 |
| 5.057871238138889 | 3.09 |
| 5.0609389136111105 | 2.91 |
| 5.064024923444444 | 2.69 |
| 5.067103155055555 | 2.59 |
| 5.070177219777778 | 2.88 |
| 5.073245728611111 | 2.88 |
| 5.07632396025 | 3.04 |
| 5.079404414194444 | 2.92 |
| 5.082486812722222 | 2.72 |
| 5.0855583773055555 | 2.74 |
| 5.0886254971666665 | 2.82 |
| 5.091718729666667 | 3.04 |
| 5.094789183055555 | 2.93 |
| 5.097868803638889 | 2.79 |
| 5.100937034694445 | 2.67 |
| 5.104008321472222 | 2.66 |
| 5.107089053222222 | 2.6 |
| 5.110187841583333 | 3.04 |
| 5.113248294416667 | 3.05 |
| 5.116337915583333 | 2.99 |
| 5.1194078133888885 | 2.59 |
| 5.122503823805556 | 2.83 |
| 5.125590389222222 | 2.92 |
| 5.128673343333333 | 2.71 |
| 5.1317632423055555 | 2.72 |
| 5.134838973777778 | 2.64 |
| 5.137916371999999 | 2.57 |
| 5.141002937444445 | 2.92 |
| 5.144074779805556 | 2.71 |
| 5.147140510722222 | 2.54 |
| 5.150213742055556 | 2.85 |
| 5.153279472944444 | 2.82 |
| 5.156343537083333 | 2.72 |
| 5.159424268861111 | 2.5 |
| 5.162494166666667 | 2.99 |
| 5.165566009027778 | 2.89 |
| 5.168670631055555 | 2.86 |
| 5.171769697194445 | 2.74 |
| 5.174847928833333 | 2.87 |
| 5.177918937805556 | 2.72 |
| 5.181008836749999 | 2.99 |
| 5.184089846305556 | 2.88 |
| 5.187163911027778 | 2.84 |
| 5.190243531611111 | 2.93 |
| 5.193314818388889 | 3 |
| 5.196399717055556 | 3.23 |
| 5.199467114722222 | 3.42 |
| 5.202536734750001 | 3.14 |
| 5.205626633694444 | 2.92 |
| 5.208691253444444 | 2.82 |
| 5.211771151805555 | 2.8 |
| 5.214845494333333 | 3.05 |
| 5.217916503305555 | 2.9 |
| 5.220988901277778 | 3.01 |
| 5.224071299805555 | 2.9 |
| 5.2271681435833335 | 3.26 |
| 5.230248319749999 | 2.86 |
| 5.233325718000001 | 2.96 |
| 5.2364028384444445 | 2.79 |
| 5.239485792555556 | 2.89 |
| 5.2425540236111114 | 2.85 |
| 5.2456469783055555 | 2.52 |
| 5.248710486861111 | 2.68 |
| 5.251792607583333 | 2.65 |
| 5.254853893777778 | 3.03 |
| 5.257937959083334 | 2.97 |
| 5.261000356444445 | 3.04 |
| 5.264077199111111 | 2.75 |
| 5.267146263527778 | 2.71 |
| 5.2702569970277775 | 2.89 |
| 5.273323005722222 | 2.77 |
| 5.276428183333333 | 2.84 |
| 5.279502525833334 | 2.85 |
| 5.282579368472222 | 2.79 |
| 5.285678434638889 | 2.99 |
| 5.288754166111111 | 2.93 |
| 5.2918223971666665 | 2.63 |
| 5.29488451675 | 3.25 |
| 5.297973304527778 | 2.85 |
| 5.301047647027778 | 2.73 |
| 5.304115600277777 | 2.69 |
| 5.307183831333333 | 3.06 |
| 5.310259007222222 | 2.65 |
| 5.313326404888889 | 2.67 |
| 5.316410470166667 | 2.86 |
| 5.319496480027778 | 2.82 |
| 5.3225736004722215 | 2.52 |
| 5.3256571101666665 | 2.68 |
| 5.328730619305556 | 2.72 |
| 5.331808017527778 | 2.63 |
| 5.334874304027777 | 2.81 |
| 5.337942535083333 | 3.15 |
| 5.341004932444444 | 2.71 |
| 5.344087330972223 | 2.96 |
| 5.347153339694445 | 2.56 |
| 5.350221848527778 | 2.85 |
| 5.353291468527777 | 2.94 |
| 5.356361644138889 | 3.1 |
| 5.359442098111112 | 2.94 |
| 5.362505884472221 | 3.02 |
| 5.365586060638889 | 3 |
| 5.36867123711111 | 2.99 |
| 5.371750302111112 | 2.81 |
| 5.374817144194445 | 2.83 |
| 5.3778834306666665 | 2.81 |
| 5.380954717444445 | 2.94 |
| 5.384060172861111 | 2.39 |
| 5.387129792861111 | 2.84 |
| 5.390212746972222 | 3.38 |
| 5.393288478472222 | 3.1 |
| 5.396375043888889 | 3.3 |
| 5.399439108027778 | 2.95 |
| 5.402527062444444 | 3.16 |
| 5.405598904805555 | 3.25 |
| 5.408681581111111 | 3.08 |
| 5.411752590111111 | 2.97 |
| 5.414846655972222 | 3.12 |
| 5.417915164805556 | 3.17 |
| 5.420989785111112 | 3.13 |
| 5.424052738083334 | 3.33 |
| 5.427145137166667 | 3.14 |
| 5.430217812916666 | 2.88 |
| 5.433292155416667 | 3.24 |
| 5.436372053805555 | 3.08 |
| 5.439457508055556 | 3.01 |
| 5.442549907166666 | 2.95 |
| 5.445638417138889 | 2.84 |
| 5.4487022035 | 3.14 |
| 5.451782101888888 | 3.02 |
| 5.454843943666667 | 3.11 |
| 5.457915786055555 | 3 |
| 5.4609865172222225 | 3.12 |
| 5.464059470777777 | 3.15 |
| 5.4671257572777785 | 2.96 |
| 5.470200377583334 | 3.13 |
| 5.473263052749999 | 3.29 |
| 5.476327116888889 | 3.14 |
| 5.479398681472222 | 3.06 |
| 5.482459967666667 | 2.69 |
| 5.485542366194444 | 3.18 |
| 5.488607819305556 | 2.91 |
| 5.4916863287222215 | 3.4 |
| 5.494765115916667 | 3.2 |
| 5.4978469588611105 | 2.83 |
| 5.500928801805555 | 3.05 |
| 5.504005644444445 | 2.82 |
| 5.507069430805556 | 2.97 |
| 5.510155996222222 | 3.14 |
| 5.513219782583334 | 3.16 |
| 5.51627995761111 | 3.1 |
| 5.519345132944444 | 3.03 |
| 5.522408085888889 | 2.88 |
| 5.525485761944444 | 2.99 |
| 5.528563437972222 | 3.21 |
| 5.531625835361111 | 2.51 |
| 5.534701844611111 | 3.03 |
| 5.537769242277777 | 3.23 |
| 5.540836362166667 | 3.07 |
| 5.543902093055556 | 3.26 |
| 5.546963934861111 | 2.9 |
| 5.550036332805555 | 2.94 |
| 5.553107619583333 | 3.11 |
| 5.556180295333333 | 2.98 |
| 5.559280472666667 | 2.91 |
| 5.5623648157500005 | 2.92 |
| 5.565452492333334 | 2.83 |
| 5.568533501888889 | 3.09 |
| 5.571610344555555 | 2.98 |
| 5.574671908555556 | 2.93 |
| 5.577737639472222 | 2.98 |
| 5.580806148305555 | 3.01 |
| 5.583896325055555 | 2.78 |
| 5.586960667 | 2.64 |
| 5.590026675694445 | 2.72 |
| 5.593100740388889 | 3.25 |
| 5.596165915722222 | 2.8 |
| 5.599241369416667 | 2.73 |
| 5.602306266916667 | 2.8 |
| 5.6053894988333335 | 3.01 |
| 5.608470230611111 | 3.06 |
| 5.611585964361111 | 2.68 |
| 5.614658640111111 | 3.41 |
| 5.617754650527778 | 3.24 |
| 5.620833993333333 | 3.31 |
| 5.623903057750001 | 3.07 |
| 5.626968510861111 | 3.1 |
| 5.630031186027778 | 3.02 |
| 5.633109973250001 | 3.02 |
| 5.636173204 | 3.26 |
| 5.639235879194444 | 2.7 |
| 5.642306054777778 | 3.06 |
| 5.645386786555556 | 2.93 |
| 5.6484591845 | 3.26 |
| 5.6515460277222225 | 3.24 |
| 5.65461092525 | 2.78 |
| 5.657699713027778 | 2.97 |
| 5.660762665999999 | 2.73 |
| 5.6638306192500005 | 2.91 |
| 5.666903850583333 | 3 |
| 5.669964303416667 | 2.96 |
| 5.673051980027778 | 3.26 |
| 5.676174380833333 | 2.89 |
| 5.67925539038889 | 2.74 |
| 5.682328066138889 | 2.5 |
| 5.685389907916666 | 3.03 |
| 5.688466472777778 | 3.15 |
| 5.691529981333333 | 3.19 |
| 5.694590711972222 | 2.87 |
| 5.697656998444444 | 2.86 |
| 5.700741619333333 | 3.03 |
| 5.703814017277778 | 2.67 |
| 5.7068947490555555 | 2.83 |
| 5.709977703166667 | 2.8 |
| 5.713048434361111 | 2.82 |
| 5.71611416525 | 2.83 |
| 5.719174895888889 | 2.6 |
| 5.722248960583333 | 2.72 |
| 5.7253341370555555 | 3.09 |
| 5.728398756777778 | 2.74 |
| 5.731473377083333 | 3.05 |
| 5.734538552416667 | 3.09 |
| 5.737607061249999 | 3.03 |
| 5.740670847583333 | 3.19 |
| 5.743734356138889 | 2.88 |
| 5.746800642638889 | 2.99 |
| 5.749890541611111 | 2.56 |
| 5.752950161055556 | 2.9 |
| 5.756010058277777 | 3.12 |
| 5.759094123555555 | 3.03 |
| 5.762176799888889 | 3.18 |
| 5.765266698833334 | 2.97 |
| 5.768332985333333 | 2.62 |
| 5.771401216388889 | 3.08 |
| 5.774482503722222 | 2.88 |
| 5.777571291499999 | 3.08 |
| 5.780633133305556 | 2.78 |
| 5.783716365222222 | 2.86 |
| 5.786779595972223 | 2.67 |
| 5.789843104527778 | 2.88 |
| 5.792919669388889 | 3.01 |
| 5.795993456305555 | 3.01 |
| 5.799077521611111 | 2.9 |
| 5.802161031305556 | 2.8 |
| 5.805235373805556 | 2.81 |
| 5.808314994388889 | 2.84 |
| 5.811394614972222 | 2.66 |
| 5.814470068666666 | 2.76 |
| 5.817532466055555 | 2.99 |
| 5.820610419888888 | 2.95 |
| 5.823706708083334 | 3.02 |
| 5.826771327805555 | 2.86 |
| 5.82984039225 | 2.97 |
| 5.832910290055556 | 2.84 |
| 5.836020467944444 | 3.42 |
| 5.839087587833333 | 2.87 |
| 5.842153040944444 | 3.12 |
| 5.845219327416667 | 2.93 |
| 5.848292003166667 | 3 |
| 5.851353567166666 | 2.8 |
| 5.854432909972222 | 2.98 |
| 5.857515864083333 | 3.26 |
| 5.860580483805556 | 3.1 |
| 5.863678716583333 | 3.34 |
| 5.866744169694445 | 2.8 |
| 5.869817678805555 | 2.83 |
| 5.872906466583333 | 3.15 |
| 5.875971086333333 | 3.11 |
| 5.879047928972223 | 3.09 |
| 5.882131716472222 | 3.03 |
| 5.88519828075 | 2.76 |
| 5.888271234305555 | 3.11 |
| 5.891337243 | 3.1 |
| 5.894406585222222 | 2.91 |
| 5.897506762527778 | 2.71 |
| 5.90056804875 | 2.71 |
| 5.903627946 | 2.89 |
| 5.906701455111111 | 2.76 |
| 5.909788853916667 | 2.99 |
| 5.912855696 | 2.98 |
| 5.915955873333333 | 2.88 |
| 5.919027160111111 | 2.84 |
| 5.9221309487500005 | 3.05 |
| 5.925191679361111 | 2.99 |
| 5.928271299944445 | 3.17 |
| 5.931333419527778 | 2.96 |
| 5.934400817194444 | 3.01 |
| 5.9374721039722225 | 2.95 |
| 5.940539501638889 | 3.18 |
| 5.943603288 | 3.09 |
| 5.946665129805555 | 2.96 |
| 5.949737805555556 | 2.97 |
| 5.952797702777778 | 3.17 |
| 5.955870100722223 | 3.27 |
| 5.958939165166666 | 3.63 |
| 5.962027119555556 | 2.95 |
| 5.9651189630833334 | 2.95 |
| 5.968180249277778 | 2.72 |
| 5.971261814416667 | 2.69 |
| 5.974332823416667 | 2.76 |
| 5.977400776666666 | 2.56 |
| 5.980469841083334 | 2.75 |
| 5.983559184472222 | 2.94 |
| 5.986634638138889 | 2.9 |
| 5.989702869194445 | 2.88 |
| 5.992777211694444 | 2.96 |
| 5.9958565544999995 | 2.91 |
| 5.998927007888889 | 2.83 |
| 6.0019877385 | 3.03 |
| 6.005080415388889 | 3.22 |
| 6.008145312916667 | 3.24 |
| 6.01121048825 | 3.39 |
| 6.014277885916667 | 2.81 |
| 6.01733833875 | 2.94 |
| 6.020407680972222 | 2.75 |
| 6.023470078333333 | 3.01 |
| 6.0265563659722226 | 2.72 |
| 6.029620985722222 | 2.88 |
| 6.032691161305555 | 2.91 |
| 6.035760503527778 | 2.62 |
| 6.038823734305556 | 2.81 |
| 6.041909188555556 | 3.01 |
| 6.044977141805556 | 2.85 |
| 6.0480456506388895 | 2.8 |
| 6.051109159194445 | 3.15 |
| 6.054171001 | 2.54 |
| 6.0572361763055556 | 2.81 |
| 6.060325797472223 | 3.12 |
| 6.063385139138889 | 2.88 |
| 6.066454481361111 | 3.14 |
| 6.069546602666667 | 2.8 |
| 6.0726137225277785 | 3.06 |
| 6.075676953305556 | 3.2 |
| 6.078741295222223 | 2.76 |
| 6.081811748638889 | 2.75 |
| 6.0848777573333335 | 2.9 |
| 6.087937932361111 | 2.8 |
| 6.091018386333333 | 2.84 |
| 6.094083283861112 | 2.71 |
| 6.097165126777777 | 2.72 |
| 6.100260303833333 | 2.91 |
| 6.103344646916667 | 2.84 |
| 6.106437601583334 | 2.78 |
| 6.109526944944445 | 2.8 |
| 6.112591009111111 | 3.1 |
| 6.11568063025 | 2.86 |
| 6.1187674734722215 | 2.72 |
| 6.121840704833333 | 2.69 |
| 6.124921714388889 | 2.77 |
| 6.127985778527778 | 2.95 |
| 6.131055676333333 | 2.78 |
| 6.134121685027778 | 3.12 |
| 6.137187971527778 | 2.86 |
| 6.140250646694445 | 2.69 |
| 6.143325822583334 | 3.11 |
| 6.146398498333333 | 2.79 |
| 6.149459228944445 | 2.67 |
| 6.152526904416667 | 2.86 |
| 6.155608469555555 | 2.77 |
| 6.158683089861111 | 2.85 |
| 6.161754932222222 | 2.84 |
| 6.164822607694444 | 2.6 |
| 6.167895561222223 | 2.96 |
| 6.170988793694445 | 2.68 |
| 6.174055080194444 | 2.77 |
| 6.177134423 | 2.76 |
| 6.1802354336944445 | 2.9 |
| 6.183315887666667 | 2.66 |
| 6.186398008388889 | 2.61 |
| 6.189470128555556 | 2.69 |
| 6.192580862027778 | 2.99 |
| 6.195650482055556 | 2.95 |
| 6.198710934888889 | 2.82 |
| 6.201842502888889 | 2.99 |
| 6.204917678777778 | 3.04 |
| 6.208002855222222 | 2.64 |
| 6.211088587277778 | 2.63 |
| 6.214170152416667 | 2.69 |
| 6.2172450505277785 | 2.92 |
| 6.220328282444444 | 2.94 |
| 6.223410125361111 | 2.98 |
| 6.226502524472223 | 3 |
| 6.2295704777222225 | 2.79 |
| 6.232635653027778 | 2.59 |
| 6.235713051277777 | 2.63 |
| 6.238800450083334 | 2.54 |
| 6.241889237861112 | 2.54 |
| 6.244968858472221 | 3.07 |
| 6.2480423675833325 | 2.73 |
| 6.251125043916667 | 2.83 |
| 6.254192441583333 | 2.75 |
| 6.257275395694444 | 2.41 |
| 6.260340293222222 | 2.59 |
| 6.26343074775 | 2.78 |
| 6.266508423777777 | 3.17 |
| 6.2696230463888885 | 2.75 |
| 6.272699055638888 | 2.74 |
| 6.275770897999999 | 2.95 |
| 6.278854963305555 | 2.88 |
| 6.281916805083334 | 3.01 |
| 6.284984480555556 | 2.94 |
| 6.288057156305555 | 3.02 |
| 6.291137610277778 | 2.65 |
| 6.2942394543611115 | 3.03 |
| 6.2973160192222215 | 2.91 |
| 6.300402029055555 | 2.67 |
| 6.303464982027778 | 2.63 |
| 6.306527657194445 | 3.08 |
| 6.309598943972222 | 2.76 |
| 6.312686342777778 | 2.69 |
| 6.3157748527777775 | 2.75 |
| 6.318834750000001 | 3.03 |
| 6.321899925333334 | 3.07 |
| 6.324962322722222 | 2.59 |
| 6.328066666944445 | 2.76 |
| 6.331178233805555 | 3.21 |
| 6.3342967455000005 | 3.18 |
| 6.337394422666666 | 3.24 |
| 6.340454597722222 | 3.06 |
| 6.343519495222222 | 3.03 |
| 6.346633562222222 | 2.87 |
| 6.349714016194444 | 2.85 |
| 6.352782525055555 | 2.82 |
| 6.355867423722223 | 2.77 |
| 6.358947599888889 | 2.67 |
| 6.362019720055556 | 2.75 |
| 6.365093229166667 | 2.81 |
| 6.368164515972222 | 2.86 |
| 6.371252470361111 | 3.14 |
| 6.374318756861111 | 3.1 |
| 6.377391154805556 | 2.67 |
| 6.380452441 | 2.81 |
| 6.38351233825 | 3.18 |
| 6.3865797359166665 | 3.2 |
| 6.389653522833333 | 2.99 |
| 6.392737865916667 | 3.07 |
| 6.395805263583334 | 3.16 |
| 6.3988757169722215 | 2.83 |
| 6.401943114638889 | 3.09 |
| 6.405024957583334 | 3.02 |
| 6.40810180025 | 2.91 |
| 6.411172809222222 | 2.97 |
| 6.414262985972222 | 3.27 |
| 6.417335106138889 | 2.96 |
| 6.420402225999999 | 2.91 |
| 6.4234979586388885 | 2.73 |
| 6.4265825795 | 2.93 |
| 6.42965608863889 | 3.05 |
| 6.432743487444445 | 3.12 |
| 6.435835886527778 | 2.86 |
| 6.438918285055555 | 2.95 |
| 6.441986793916667 | 2.88 |
| 6.4450528026111105 | 2.92 |
| 6.448122978222222 | 2.91 |
| 6.451191209249999 | 2.78 |
| 6.45426221825 | 2.81 |
| 6.457336005166666 | 2.79 |
| 6.4604061807777775 | 2.87 |
| 6.463496357527777 | 2.89 |
| 6.4665904233888885 | 2.99 |
| 6.469669488388889 | 3.14 |
| 6.472730774583333 | 3.04 |
| 6.4758151176666665 | 3.1 |
| 6.478887237833334 | 3.31 |
| 6.4819563022499995 | 2.68 |
| 6.485022033166667 | 3.06 |
| 6.488088319638889 | 2.6 |
| 6.491183496694445 | 2.82 |
| 6.494285896361111 | 2.76 |
| 6.497368850472222 | 2.93 |
| 6.500445693111112 | 2.88 |
| 6.503525035916667 | 2.83 |
| 6.506610212388889 | 2.93 |
| 6.509685943861111 | 3.05 |
| 6.512769453555555 | 3.27 |
| 6.515831573138889 | 2.96 |
| 6.518898693027778 | 2.97 |
| 6.521974146694444 | 2.97 |
| 6.525053767277777 | 2.99 |
| 6.528120053777778 | 2.87 |
| 6.531209952722222 | 2.71 |
| 6.534300685083333 | 3.02 |
| 6.5373622490833325 | 3.07 |
| 6.540461037416667 | 2.97 |
| 6.5435453804999995 | 3.14 |
| 6.5466305569722225 | 2.91 |
| 6.549733512222223 | 2.82 |
| 6.552800909888889 | 2.75 |
| 6.555881641638889 | 2.88 |
| 6.558977374277777 | 3.09 |
| 6.562060050583334 | 2.74 |
| 6.565148560583333 | 2.93 |
| 6.56823345925 | 2.79 |
| 6.571337803472223 | 3.03 |
| 6.574403812166667 | 2.76 |
| 6.577468709694445 | 2.95 |
| 6.580548330277777 | 2.94 |
| 6.5836373958611105 | 3.12 |
| 6.586705904694444 | 2.56 |
| 6.58978997 | 2.98 |
| 6.592868201611111 | 2.89 |
| 6.595939210583333 | 2.84 |
| 6.599001885777778 | 2.81 |
| 6.602075117111111 | 2.87 |
| 6.605156960027778 | 3.12 |
| 6.608226302249999 | 2.87 |
| 6.611314812250001 | 3.17 |
| 6.614395266222222 | 2.62 |
| 6.61746821975 | 2.44 |
| 6.620530617138889 | 2.75 |
| 6.623611904500001 | 3.09 |
| 6.626681246722222 | 2.88 |
| 6.629772256833333 | 2.85 |
| 6.632839098916667 | 2.81 |
| 6.635908163361112 | 2.45 |
| 6.638969171777777 | 2.84 |
| 6.642061848666667 | 2.8 |
| 6.645131190888889 | 2.74 |
| 6.648206644555556 | 2.82 |
| 6.651307655277777 | 2.57 |
| 6.654388664833333 | 2.87 |
| 6.6574491176388895 | 2.95 |
| 6.660528738222222 | 2.87 |
| 6.663599747222222 | 2.79 |
| 6.666702980277778 | 2.86 |
| 6.669764266472223 | 2.76 |
| 6.672826663861111 | 2.87 |
| 6.675946286722223 | 3.14 |
| 6.67901201763889 | 3.13 |
| 6.682110806 | 3.13 |
| 6.685182648361111 | 3.34 |
| 6.688258379833334 | 3.09 |
| 6.691337167055555 | 2.73 |
| 6.694401231194445 | 2.81 |
| 6.6974780738333335 | 2.56 |
| 6.700540471222221 | 3 |
| 6.703611758 | 2.9 |
| 6.70669721225 | 2.99 |
| 6.709757665083333 | 3.04 |
| 6.71283311875 | 3 |
| 6.715935240638888 | 2.57 |
| 6.719016250194444 | 3.04 |
| 6.722080869916667 | 2.79 |
| 6.725142989527778 | 2.61 |
| 6.728209831583333 | 2.89 |
| 6.731269451027777 | 2.86 |
| 6.734360461166666 | 2.73 |
| 6.737421469583333 | 2.55 |
| 6.740503590305555 | 2.65 |
| 6.743567654444444 | 2.66 |
| 6.746628107277778 | 2.8 |
| 6.749696616111111 | 2.69 |
| 6.752775403333333 | 2.74 |
| 6.755859468611112 | 2.77 |
| 6.758927977472222 | 3 |
| 6.7620184320000005 | 2.97 |
| 6.765092218916666 | 2.7 |
| 6.768161838944444 | 2.75 |
| 6.771231736750001 | 2.66 |
| 6.7743055236666665 | 2.83 |
| 6.777369310027778 | 2.73 |
| 6.780430874027778 | 2.52 |
| 6.783512161361112 | 2.71 |
| 6.786574003166667 | 2.91 |
| 6.789659735222223 | 2.93 |
| 6.792727966277778 | 2.58 |
| 6.795798975249999 | 2.83 |
| 6.798894152277778 | 2.63 |
| 6.801988773722222 | 3.07 |
| 6.805050615527778 | 2.78 |
| 6.808114401861111 | 2.95 |
| 6.811215690361111 | 2.91 |
| 6.814296977722222 | 2.63 |
| 6.8173702090555555 | 2.7 |
| 6.820452885361111 | 2.66 |
| 6.8235172273055555 | 2.63 |
| 6.826583513805556 | 2.9 |
| 6.829684802305556 | 2.87 |
| 6.832746366305555 | 2.71 |
| 6.835808763666666 | 2.75 |
| 6.838886995305556 | 2.84 |
| 6.841948559305556 | 2.9 |
| 6.845011234472222 | 2.7 |
| 6.848092799611111 | 2.7 |
| 6.851166030944444 | 2.72 |
| 6.85424537375 | 2.51 |
| 6.857309160111111 | 2.61 |
| 6.8603723908611105 | 2.99 |
| 6.863438677361112 | 2.67 |
| 6.8665027415 | 2.74 |
| 6.869575139444445 | 2.88 |
| 6.872646704027778 | 2.86 |
| 6.875724380055556 | 2.98 |
| 6.87880316725 | 2.75 |
| 6.881875009638889 | 2.76 |
| 6.884954908 | 2.69 |
| 6.888028972722222 | 2.7 |
| 6.891101370666666 | 2.65 |
| 6.894160990111112 | 2.68 |
| 6.897227554416666 | 2.83 |
| 6.900289674 | 2.84 |
| 6.903364294305556 | 2.63 |
| 6.906435858861111 | 2.96 |
| 6.909499089638889 | 2.85 |
| 6.912575098916667 | 2.81 |
| 6.915646663472223 | 2.82 |
| 6.918720172611111 | 3 |
| 6.921798959805556 | 2.85 |
| 6.924873580111111 | 2.73 |
| 6.927952367333333 | 2.84 |
| 6.931024209694444 | 2.66 |
| 6.934094385305555 | 2.68 |
| 6.9371915068888885 | 2.79 |
| 6.940261960277778 | 2.69 |
| 6.943332969277778 | 3.04 |
| 6.946416478972223 | 2.99 |
| 6.94948304325 | 3.05 |
| 6.952552385472222 | 2.96 |
| 6.955616171833333 | 3.17 |
| 6.95868051375 | 3.13 |
| 6.96178652475 | 2.82 |
| 6.964851977861111 | 2.55 |
| 6.967922986861111 | 2.56 |
| 6.970987606583334 | 2.81 |
| 6.974064171444445 | 2.77 |
| 6.977145458777778 | 3.04 |
| 6.98020841175 | 2.82 |
| 6.983289976888889 | 3.01 |
| 6.986360430305555 | 2.83 |
| 6.989438661916666 | 3.09 |
| 6.992502448277778 | 2.82 |
| 6.995575679611111 | 2.83 |
| 6.998655300194444 | 2.74 |
| 7.001721031083333 | 2.91 |
| 7.004793984638889 | 3.15 |
| 7.007865271416667 | 2.64 |
| 7.010926835416667 | 2.55 |
| 7.014021179055555 | 2.9 |
| 7.017095521583334 | 2.93 |
| 7.020178475694444 | 3.05 |
| 7.023240317472222 | 3.04 |
| 7.026305215 | 2.99 |
| 7.029380946472222 | 2.97 |
| 7.032442510499999 | 2.99 |
| 7.03552074211111 | 3.08 |
| 7.038596751388889 | 3.18 |
| 7.041677760944445 | 3.02 |
| 7.044740436111111 | 2.88 |
| 7.047820612277778 | 2.75 |
| 7.050896065972222 | 3.15 |
| 7.053957074388888 | 2.86 |
| 7.057020582944444 | 2.77 |
| 7.060082424722222 | 2.89 |
| 7.063152878138888 | 2.92 |
| 7.066232220916667 | 2.97 |
| 7.069302118722223 | 2.91 |
| 7.072366460666666 | 2.95 |
| 7.075439969805556 | 3.03 |
| 7.078507367472222 | 2.85 |
| 7.081578932027778 | 2.8 |
| 7.0846674420277775 | 2.74 |
| 7.087740395555556 | 2.81 |
| 7.090804181916667 | 2.81 |
| 7.093886580444444 | 2.72 |
| 7.0969545336944435 | 3.1 |
| 7.1000149865277775 | 2.99 |
| 7.103093218138889 | 3.07 |
| 7.106153670972222 | 2.83 |
| 7.109230513611111 | 2.98 |
| 7.112301800388889 | 2.72 |
| 7.115372253805556 | 2.85 |
| 7.118449374250001 | 2.93 |
| 7.121515660722222 | 2.87 |
| 7.124576946944444 | 2.88 |
| 7.127662678999999 | 2.61 |
| 7.130723687416666 | 2.89 |
| 7.133801363444444 | 2.81 |
| 7.136872650222223 | 2.92 |
| 7.139943937 | 2.92 |
| 7.143018835083334 | 2.56 |
| 7.146093177611111 | 2.74 |
| 7.14915724175 | 2.33 |
| 7.152233251 | 2.37 |
| 7.155299259722223 | 2.97 |
| 7.158365546194444 | 3.11 |
| 7.1614465557499996 | 2.94 |
| 7.1645100643055555 | 2.93 |
| 7.167605519138888 | 2.69 |
| 7.170668472111111 | 2.98 |
| 7.173732814055556 | 2.75 |
| 7.176809101111111 | 2.7 |
| 7.179889555083334 | 2.58 |
| 7.182952508055555 | 2.66 |
| 7.186030461888889 | 2.75 |
| 7.189102026444444 | 2.84 |
| 7.192165535 | 2.85 |
| 7.195246544555555 | 3.04 |
| 7.198327276333334 | 2.58 |
| 7.201392451638889 | 2.62 |
| 7.2044734611944445 | 2.64 |
| 7.207535025194445 | 2.77 |
| 7.2105999227222215 | 2.72 |
| 7.213660931138889 | 3.04 |
| 7.216737218194444 | 2.76 |
| 7.2198037825 | 3.15 |
| 7.222872291333333 | 2.99 |
| 7.2259699685 | 2.79 |
| 7.229049033527778 | 2.9 |
| 7.232129487472221 | 2.57 |
| 7.2352257756944445 | 2.72 |
| 7.238295395722222 | 2.97 |
| 7.241356681916667 | 2.77 |
| 7.244422968416667 | 2.53 |
| 7.247493144 | 2.74 |
| 7.250556930361111 | 2.85 |
| 7.253624050222222 | 3.01 |
| 7.256695337027778 | 3.01 |
| 7.2597596789444445 | 3.05 |
| 7.262839299527778 | 2.95 |
| 7.265915308805556 | 2.99 |
| 7.268997707333334 | 2.93 |
| 7.272066493972223 | 2.98 |
| 7.275128613555556 | 3.04 |
| 7.27819934475 | 3.11 |
| 7.281296466333333 | 2.74 |
| 7.284370531055556 | 2.97 |
| 7.287431539472222 | 3.01 |
| 7.290498659333333 | 3 |
| 7.293572168472222 | 2.94 |
| 7.296632621305556 | 3 |
| 7.299711130722222 | 2.89 |
| 7.302779083972222 | 2.9 |
| 7.305864816027778 | 2.98 |
| 7.308956937305555 | 2.9 |
| 7.312017945722222 | 3.08 |
| 7.315104788944445 | 3.06 |
| 7.318182742777778 | 2.89 |
| 7.3212459735555555 | 3.01 |
| 7.324323371777778 | 2.88 |
| 7.32738882488889 | 3.09 |
| 7.330463722999999 | 2.83 |
| 7.333543621361111 | 2.85 |
| 7.336605463166666 | 3.02 |
| 7.339681194638889 | 3.16 |
| 7.342764982138888 | 3.23 |
| 7.3458371023055555 | 3.14 |
| 7.348907833499999 | 3.13 |
| 7.351970230861111 | 2.81 |
| 7.35503262825 | 2.97 |
| 7.35811641575 | 2.62 |
| 7.3611882581111105 | 3 |
| 7.3642681565 | 2.77 |
| 7.3673541663333335 | 2.58 |
| 7.370416285916667 | 2.89 |
| 7.373488961666666 | 2.73 |
| 7.376561359638889 | 2.82 |
| 7.379622368027778 | 3.08 |
| 7.382700044083334 | 2.69 |
| 7.385772164222222 | 2.76 |
| 7.388840117472222 | 2.69 |
| 7.391925016166667 | 2.91 |
| 7.39499435838889 | 2.41 |
| 7.398055922388889 | 2.96 |
| 7.401129987083334 | 2.84 |
| 7.404217663694444 | 2.59 |
| 7.407300617805555 | 2.91 |
| 7.410383016333333 | 2.8 |
| 7.413454858694444 | 2.92 |
| 7.416524478722222 | 3.08 |
| 7.419604377111111 | 3.12 |
| 7.422685108861111 | 2.97 |
| 7.425749173 | 2.95 |
| 7.428864906777777 | 2.96 |
| 7.43192785975 | 2.79 |
| 7.435016925305556 | 2.7 |
| 7.438088489888889 | 2.71 |
| 7.441156165361111 | 2.81 |
| 7.4442216184722225 | 2.6 |
| 7.447295405388889 | 2.94 |
| 7.450358358361111 | 2.88 |
| 7.453427978361112 | 3.03 |
| 7.456501765277777 | 2.84 |
| 7.459566940611111 | 2.69 |
| 7.462634893861112 | 3.08 |
| 7.465712847694444 | 3.07 |
| 7.4687921904722225 | 2.85 |
| 7.471854032277778 | 2.7 |
| 7.474926985805555 | 3.05 |
| 7.477996050250001 | 2.87 |
| 7.4810667814444445 | 2.87 |
| 7.484139457194444 | 2.85 |
| 7.487216022055556 | 2.83 |
| 7.490275363694444 | 2.98 |
| 7.4933402612222215 | 3.1 |
| 7.496415992694445 | 2.61 |
| 7.4994889462500005 | 2.77 |
| 7.502557732861112 | 2.88 |
| 7.505628186277777 | 2.65 |
| 7.508691417027778 | 2.52 |
| 7.511787983027777 | 2.53 |
| 7.514848435861111 | 2.69 |
| 7.517915555722222 | 3.05 |
| 7.521000454388889 | 3.03 |
| 7.524065351916667 | 2.93 |
| 7.527129971666667 | 2.84 |
| 7.530199591666666 | 3.01 |
| 7.5332636558055555 | 3.14 |
| 7.5363477211111105 | 2.68 |
| 7.539417341111111 | 2.85 |
| 7.5424894612777775 | 2.76 |
| 7.545586305083333 | 2.8 |
| 7.548648702472222 | 2.77 |
| 7.551708877499999 | 2.73 |
| 7.5547834978055555 | 2.74 |
| 7.55785117325 | 2.8 |
| 7.560926626944444 | 2.82 |
| 7.563989857694445 | 2.76 |
| 7.567056144194444 | 2.77 |
| 7.570131320083333 | 2.94 |
| 7.573191772916667 | 2.75 |
| 7.576279727305556 | 2.74 |
| 7.579363792583333 | 2.95 |
| 7.582432579222223 | 2.94 |
| 7.585497754555556 | 2.98 |
| 7.5885662633888895 | 2.87 |
| 7.591658940277777 | 2.62 |
| 7.594786619166666 | 3.05 |
| 7.597853183472222 | 3.17 |
| 7.600923359055556 | 2.93 |
| 7.603986589833333 | 2.83 |
| 7.607101212416667 | 3.02 |
| 7.6101855555 | 2.82 |
| 7.613254897722221 | 3.21 |
| 7.616325351111111 | 3.03 |
| 7.619386915111112 | 2.72 |
| 7.62245097925 | 2.75 |
| 7.625525599555556 | 2.61 |
| 7.628624110111112 | 2.95 |
| 7.631696230277778 | 2.92 |
| 7.634772795138889 | 2.9 |
| 7.63784852661111 | 2.7 |
| 7.640930647361111 | 3.06 |
| 7.643996100472223 | 2.72 |
| 7.647090999694444 | 2.91 |
| 7.6501642310277775 | 3.07 |
| 7.653255518972222 | 2.91 |
| 7.656326527944445 | 2.94 |
| 7.659391425472222 | 2.84 |
| 7.662472712805555 | 2.83 |
| 7.665557333694445 | 2.84 |
| 7.668648066027778 | 3.21 |
| 7.671709352222222 | 2.76 |
| 7.674786750472222 | 3.06 |
| 7.6778477588888885 | 2.98 |
| 7.680910156277778 | 3.01 |
| 7.683973387027778 | 2.77 |
| 7.6870393957222225 | 2.91 |
| 7.690111238083333 | 2.86 |
| 7.693191414277777 | 2.53 |
| 7.6962540894444444 | 3.05 |
| 7.699316764611112 | 2.98 |
| 7.7023919405 | 2.87 |
| 7.705458227 | 3.03 |
| 7.70854368125 | 2.64 |
| 7.711624413027778 | 3.11 |
| 7.714691255111111 | 3.12 |
| 7.717762541888888 | 2.79 |
| 7.720825217055555 | 2.85 |
| 7.723911226888888 | 2.77 |
| 7.726990569694444 | 2.87 |
| 7.730074634972222 | 3.1 |
| 7.733145088388889 | 2.91 |
| 7.7362327650000005 | 2.81 |
| 7.739312107777778 | 2.69 |
| 7.742387005888889 | 2.71 |
| 7.745457181472222 | 2.89 |
| 7.748522634583334 | 2.88 |
| 7.751594754749999 | 2.9 |
| 7.754680486805555 | 3.09 |
| 7.757742606388889 | 3.06 |
| 7.76081444875 | 2.84 |
| 7.763899903 | 2.93 |
| 7.766961189222222 | 2.86 |
| 7.7700421987777775 | 2.93 |
| 7.773126264055556 | 2.9 |
| 7.776224219027778 | 3 |
| 7.779293839055556 | 3.03 |
| 7.782364848027777 | 2.96 |
| 7.785446968777778 | 2.85 |
| 7.788546034916666 | 3.25 |
| 7.791615099333334 | 2.82 |
| 7.794712220944445 | 2.8 |
| 7.7977782296388884 | 3.31 |
| 7.80083979363889 | 2.75 |
| 7.803917469666667 | 2.89 |
| 7.806986811888889 | 2.78 |
| 7.810058932055556 | 2.8 |
| 7.813124107361111 | 2.82 |
| 7.8161976165 | 3.16 |
| 7.8192766815 | 2.92 |
| 7.822337967694445 | 2.98 |
| 7.825420644027778 | 2.88 |
| 7.828504987111112 | 2.77 |
| 7.831575718277778 | 2.69 |
| 7.834646171694445 | 2.69 |
| 7.837727459027778 | 2.83 |
| 7.840795967888889 | 2.94 |
| 7.843858920861111 | 2.78 |
| 7.846927985277778 | 2.81 |
| 7.8499892715 | 3.17 |
| 7.853059447083333 | 2.79 |
| 7.856130456083334 | 2.96 |
| 7.8591995205 | 2.89 |
| 7.862269973888889 | 2.92 |
| 7.865348205527778 | 2.75 |
| 7.868410325111111 | 2.78 |
| 7.871483278638888 | 2.99 |
| 7.874578733472222 | 2.61 |
| 7.877662798777778 | 3.04 |
| 7.880736863472222 | 2.68 |
| 7.883801483222222 | 2.9 |
| 7.886873047777778 | 2.88 |
| 7.8899679470277775 | 2.83 |
| 7.893048956583333 | 2.95 |
| 7.896135244222222 | 2.8 |
| 7.8991968082222215 | 2.54 |
| 7.902286151583334 | 2.63 |
| 7.905349937944444 | 3.02 |
| 7.908416224416667 | 2.81 |
| 7.911490011361111 | 2.98 |
| 7.914566854 | 2.96 |
| 7.917658419722222 | 2.77 |
| 7.920723872833333 | 3.04 |
| 7.923820994416666 | 2.76 |
| 7.926891447805556 | 2.92 |
| 7.929991902944444 | 2.86 |
| 7.933064023083333 | 2.74 |
| 7.936155588805556 | 2.88 |
| 7.93923743175 | 3.11 |
| 7.942770133805555 | 2.97 |
| 7.945841420583334 | 3.12 |
| 7.948906318111112 | 2.97 |
| 7.951972604611111 | 2.92 |
| 7.955081393527778 | 2.91 |
| 7.958151013527778 | 2.7 |
| 7.961247301749999 | 3 |
| 7.964324977777778 | 3 |
| 7.967402653805556 | 2.99 |
| 7.970477829694444 | 2.8 |
| 7.973545505166666 | 2.83 |
| 7.976609013722222 | 2.76 |
| 7.979668910972222 | 3.08 |
| 7.982752698444445 | 2.87 |
| 7.985852042388888 | 2.95 |
| 7.988951941916667 | 2.87 |
| 7.992018506194444 | 2.89 |
| 7.995103960472223 | 2.83 |
| 7.998177747388889 | 2.98 |
| 8.00124014475 | 2.91 |
| 8.004428660472222 | 2.84 |
| 8.00750244738889 | 3 |
| 8.010594568694444 | 2.68 |
| 8.013662244166666 | 3.24 |
| 8.016736031083333 | 3.22 |
| 8.019799539638889 | 3.17 |
| 8.022877493472222 | 2.6 |
| 8.025987393555555 | 2.95 |
| 8.029075903555555 | 2.9 |
| 8.032153301777779 | 2.92 |
| 8.035235422527778 | 3.08 |
| 8.038322265749999 | 3.02 |
| 8.041392719138889 | 3 |
| 8.044470117388888 | 2.9 |
| 8.04755223811111 | 3.03 |
| 8.050627414000001 | 3.03 |
| 8.053713979416667 | 2.99 |
| 8.056802211611112 | 3.11 |
| 8.059877665305555 | 3.14 |
| 8.062970897777777 | 3.15 |
| 8.066040517805556 | 3.11 |
| 8.069108193249999 | 3 |
| 8.072200592361112 | 2.82 |
| 8.075272156916666 | 3.04 |
| 8.07833510988889 | 2.76 |
| 8.081418064 | 2.72 |
| 8.084494351083332 | 2.82 |
| 8.087564248888889 | 2.85 |
| 8.090641924916667 | 3.07 |
| 8.093752658388889 | 3 |
| 8.096852002333334 | 2.98 |
| 8.099936901 | 2.91 |
| 8.10299679825 | 2.97 |
| 8.106065029305555 | 2.8 |
| 8.109134093722222 | 3.16 |
| 8.112233437666667 | 2.63 |
| 8.115295001666667 | 2.86 |
| 8.118363232722222 | 2.7 |
| 8.12143840861111 | 2.62 |
| 8.124505806277778 | 2.86 |
| 8.127631818388888 | 2.73 |
| 8.130715605888888 | 2.94 |
| 8.133779947833334 | 2.58 |
| 8.13684901225 | 2.67 |
| 8.139927243888888 | 2.87 |
| 8.1429879745 | 2.86 |
| 8.146061483638888 | 2.98 |
| 8.149149993611111 | 2.74 |
| 8.152224058333333 | 3.05 |
| 8.155290900416666 | 3.1 |
| 8.158374965694444 | 3.02 |
| 8.161449030416666 | 2.94 |
| 8.164528095416667 | 2.99 |
| 8.167611327305556 | 2.9 |
| 8.17068511425 | 3.15 |
| 8.173755845444445 | 2.87 |
| 8.176821854138888 | 2.85 |
| 8.17988980738889 | 2.67 |
| 8.182977206194446 | 2.7 |
| 8.186055160027779 | 2.66 |
| 8.189118946361111 | 2.85 |
| 8.192185232861112 | 3 |
| 8.195264020083332 | 2.88 |
| 8.198326417444445 | 3.11 |
| 8.201393537333333 | 2.99 |
| 8.204472324527778 | 3.07 |
| 8.207545000277777 | 2.87 |
| 8.210613786916667 | 3.03 |
| 8.213688407222223 | 2.86 |
| 8.216753026944444 | 2.93 |
| 8.21981875786111 | 2.84 |
| 8.22288671111111 | 2.73 |
| 8.225997166805556 | 2.91 |
| 8.229267909416667 | 3.06 |
| 8.232328084472222 | 2.83 |
| 8.235392981972222 | 3.05 |
| 8.238458157305555 | 2.85 |
| 8.241518332333333 | 2.88 |
| 8.24459211925 | 2.93 |
| 8.247673962194446 | 2.8 |
| 8.250734970611111 | 2.93 |
| 8.2538101465 | 2.8 |
| 8.25687726636111 | 3.33 |
| 8.259951886666666 | 3.1 |
| 8.263013728472222 | 2.49 |
| 8.266095849194445 | 2.76 |
| 8.269160191138889 | 2.89 |
| 8.272225088666666 | 2.82 |
| 8.27529109736111 | 3.04 |
| 8.278400719666667 | 2.89 |
| 8.28147784011111 | 2.85 |
| 8.284564405527778 | 2.96 |
| 8.287639303638889 | 3 |
| 8.29070864586111 | 2.82 |
| 8.293772987805555 | 2.99 |
| 8.296842885611111 | 2.84 |
| 8.299962508472223 | 3.2 |
| 8.303032406305556 | 2.88 |
| 8.306112582472222 | 2.93 |
| 8.309176368805556 | 2.88 |
| 8.312241266333334 | 2.63 |
| 8.315325053833334 | 2.79 |
| 8.318408007944445 | 2.98 |
| 8.321513741138888 | 2.91 |
| 8.324579472055555 | 2.73 |
| 8.327667148666666 | 3.11 |
| 8.330750102777777 | 2.96 |
| 8.333811666777779 | 2.62 |
| 8.336910732916666 | 2.74 |
| 8.34001424375 | 2.84 |
| 8.343119699166667 | 3.07 |
| 8.346207097972222 | 2.83 |
| 8.349270606527778 | 2.71 |
| 8.352356338583334 | 2.92 |
| 8.355420402722222 | 2.74 |
| 8.358508079333333 | 3.06 |
| 8.361575199194444 | 3.1 |
| 8.364657042138889 | 3.13 |
| 8.367742774194445 | 2.59 |
| 8.370806560527777 | 2.94 |
| 8.37387340261111 | 2.88 |
| 8.37694218925 | 3.02 |
| 8.3800101425 | 2.98 |
| 8.383083373833333 | 2.81 |
| 8.386147160194444 | 2.86 |
| 8.389235670166666 | 2.72 |
| 8.392299178722222 | 2.85 |
| 8.39541185675 | 2.99 |
| 8.398480921194444 | 2.87 |
| 8.40155165238889 | 3.25 |
| 8.404614883138889 | 3.12 |
| 8.407682280805556 | 2.84 |
| 8.410761345805556 | 2.8 |
| 8.413841244194444 | 2.74 |
| 8.416902252611111 | 3.17 |
| 8.420006596833334 | 2.69 |
| 8.42308510625 | 2.76 |
| 8.426155559638888 | 3.13 |
| 8.429246847555556 | 2.79 |
| 8.4323111895 | 2.79 |
| 8.435398032722222 | 3.02 |
| 8.438482375805556 | 2.76 |
| 8.441566441111112 | 2.98 |
| 8.444636616694444 | 2.98 |
| 8.447696513944445 | 2.8 |
| 8.450766689555556 | 2.77 |
| 8.453844365583333 | 2.81 |
| 8.456908429722223 | 2.72 |
| 8.459971660472222 | 3.06 |
| 8.46305961488889 | 2.86 |
| 8.466122567861111 | 2.75 |
| 8.469201355055556 | 2.8 |
| 8.472270697277777 | 3.03 |
| 8.475346706555555 | 2.95 |
| 8.478418271111112 | 2.7 |
| 8.481486224388888 | 2.55 |
| 8.484590568611111 | 3.03 |
| 8.487659910833333 | 2.83 |
| 8.490720363666668 | 3.12 |
| 8.493801095416666 | 2.96 |
| 8.496877938055556 | 3.05 |
| 8.499939779861112 | 2.75 |
| 8.503009122083332 | 2.76 |
| 8.506080131083333 | 2.83 |
| 8.509154473583333 | 2.84 |
| 8.512231594027778 | 2.84 |
| 8.515296491555556 | 2.93 |
| 8.518376667722222 | 2.69 |
| 8.521466288888888 | 2.86 |
| 8.524528130666667 | 2.91 |
| 8.527594694972223 | 2.91 |
| 8.530657925722222 | 2.65 |
| 8.533721712083333 | 2.76 |
| 8.536781331527777 | 2.86 |
| 8.539860396527777 | 2.99 |
| 8.54293362786111 | 3.01 |
| 8.546001581111112 | 2.97 |
| 8.549085090805555 | 2.56 |
| 8.552150821722222 | 2.58 |
| 8.555220719527778 | 2.94 |
| 8.558335897694445 | 2.92 |
| 8.561403017583332 | 2.67 |
| 8.564467637305556 | 2.93 |
| 8.567559203027777 | 2.95 |
| 8.570618544666667 | 2.85 |
| 8.573684275583334 | 3.1 |
| 8.576748617527779 | 2.84 |
| 8.579809903722223 | 2.82 |
| 8.582899247083335 | 2.8 |
| 8.585971922833334 | 2.68 |
| 8.589046820944445 | 3.02 |
| 8.592131441805556 | 2.83 |
| 8.595211618 | 2.72 |
| 8.598291516361112 | 2.91 |
| 8.601372803722223 | 2.71 |
| 8.604432700972222 | 2.65 |
| 8.607495931722221 | 2.9 |
| 8.610591386555555 | 2.68 |
| 8.613667951416666 | 3.14 |
| 8.61673896038889 | 2.74 |
| 8.619799691 | 3.11 |
| 8.622869866611111 | 3.16 |
| 8.62594087561111 | 2.84 |
| 8.629011051194444 | 2.94 |
| 8.63209678325 | 3.15 |
| 8.635163347527778 | 2.76 |
| 8.63824435711111 | 2.9 |
| 8.641327033416667 | 2.72 |
| 8.644393042111112 | 2.91 |
| 8.647455161694445 | 2.92 |
| 8.650525059527778 | 2.83 |
| 8.653586067916667 | 2.87 |
| 8.656676522472221 | 2.99 |
| 8.659748364833334 | 2.93 |
| 8.66281492911111 | 2.6 |
| 8.66589316075 | 2.63 |
| 8.668965558694445 | 2.96 |
| 8.672040179 | 2.62 |
| 8.675138689555556 | 2.74 |
| 8.678217476750001 | 3.2 |
| 8.681304597777778 | 3.02 |
| 8.684378384694444 | 2.94 |
| 8.687447171333334 | 3 |
| 8.690517069138888 | 2.9 |
| 8.693598634305555 | 3.29 |
| 8.696679366055555 | 2.74 |
| 8.699753708555555 | 2.93 |
| 8.702818606083333 | 2.73 |
| 8.70589794888889 | 3.12 |
| 8.708960624055555 | 3.13 |
| 8.712029966277777 | 3.1 |
| 8.715101530861112 | 3.11 |
| 8.718161705888889 | 2.68 |
| 8.72124632675 | 3.07 |
| 8.724308168555556 | 2.97 |
| 8.72737806636111 | 2.8 |
| 8.7304421305 | 2.71 |
| 8.733503416722222 | 2.95 |
| 8.736575259083333 | 3.14 |
| 8.739643212333334 | 3.15 |
| 8.742713110138888 | 2.97 |
| 8.74578884161111 | 3 |
| 8.748849850027778 | 2.94 |
| 8.75193669325 | 2.88 |
| 8.755012702527777 | 2.78 |
| 8.758090378555556 | 2.93 |
| 8.761181944277778 | 2.89 |
| 8.764246008416666 | 2.9 |
| 8.767307850222222 | 3.02 |
| 8.770386637416665 | 2.8 |
| 8.773452923916667 | 3.05 |
| 8.776522543944445 | 2.5 |
| 8.779591052777779 | 2.85 |
| 8.78265817263889 | 3.01 |
| 8.785746404833333 | 2.9 |
| 8.788819913972223 | 3.26 |
| 8.791894534277777 | 3.01 |
| 8.79496943236111 | 2.86 |
| 8.798048497361112 | 3.26 |
| 8.801116728416668 | 2.98 |
| 8.804208294138888 | 2.88 |
| 8.807270691527778 | 3.15 |
| 8.810349478722221 | 3.1 |
| 8.813448267083333 | 3.51 |
| 8.816565389805556 | 2.72 |
| 8.819654177583333 | 2.77 |
| 8.822717963944443 | 2.65 |
| 8.825783694833333 | 2.79 |
| 8.828860259694444 | 2.81 |
| 8.831922379305556 | 2.99 |
| 8.834995055027777 | 3.1 |
| 8.83805550786111 | 2.84 |
| 8.841139017555555 | 2.95 |
| 8.844199192583334 | 2.58 |
| 8.847259645416667 | 2.6 |
| 8.850323153972221 | 2.92 |
| 8.853386106944445 | 2.65 |
| 8.85644794875 | 2.69 |
| 8.859542847972222 | 2.94 |
| 8.862605800944445 | 2.82 |
| 8.865667642750001 | 2.96 |
| 8.868749763472222 | 2.76 |
| 8.871810771888889 | 2.93 |
| 8.874904004361111 | 2.88 |
| 8.877978902472222 | 2.84 |
| 8.881055467333333 | 2.9 |
| 8.884117309111112 | 2.7 |
| 8.887184429 | 2.72 |
| 8.890245715194444 | 3 |
| 8.893308945972223 | 2.73 |
| 8.896376621416666 | 2.74 |
| 8.899442352333333 | 2.88 |
| 8.902530584527778 | 2.61 |
| 8.905591037333334 | 3.04 |
| 8.908687603333334 | 3.16 |
| 8.911752778666667 | 2.73 |
| 8.914814620444444 | 2.97 |
| 8.917893407666668 | 2.88 |
| 8.920958860777779 | 2.72 |
| 8.924020146972222 | 2.89 |
| 8.927083933333334 | 3.19 |
| 8.930163276138888 | 2.98 |
| 8.933246785833333 | 2.7 |
| 8.936322517305555 | 2.93 |
| 8.939408249361112 | 2.62 |
| 8.942487314361111 | 2.7 |
| 8.945567768333333 | 2.76 |
| 8.948635721583333 | 2.9 |
| 8.95170867511111 | 2.98 |
| 8.954794129388889 | 2.78 |
| 8.95785569338889 | 2.94 |
| 8.96091725738889 | 2.94 |
| 8.963981599305555 | 2.8 |
| 8.967045663444445 | 2.83 |
| 8.970110560972222 | 2.62 |
| 8.973177680861111 | 2.83 |
| 8.976251745583333 | 2.74 |
| 8.979330532777778 | 3.07 |
| 8.98239765263889 | 2.9 |
| 8.985483106916668 | 2.84 |
| 8.988545226500001 | 2.97 |
| 8.991610124027778 | 2.81 |
| 8.994683910944445 | 2.86 |
| 8.997744641555554 | 2.81 |
| 9.0008264845 | 2.66 |
| 9.00390388275 | 3.06 |
| 9.006974613916666 | 2.83 |
| 9.010041456 | 2.88 |
| 9.01312441011111 | 2.92 |
| 9.016189585444444 | 2.51 |
| 9.019257538694445 | 2.99 |
| 9.02232354738889 | 2.84 |
| 9.025388444916667 | 2.67 |
| 9.028473343583334 | 2.86 |
| 9.031547686083334 | 2.75 |
| 9.034614528166667 | 2.9 |
| 9.037676092166667 | 2.89 |
| 9.04073737838889 | 3.12 |
| 9.043820332500001 | 2.93 |
| 9.046882174277778 | 2.87 |
| 9.049950127555556 | 2.87 |
| 9.053036137388888 | 2.57 |
| 9.056107701972222 | 2.87 |
| 9.059188711527778 | 2.91 |
| 9.062282777388889 | 3.2 |
| 9.0653482305 | 2.89 |
| 9.068436184888888 | 2.92 |
| 9.071533028694445 | 2.99 |
| 9.074605982222222 | 2.83 |
| 9.077678380166667 | 2.9 |
| 9.080752167111111 | 2.73 |
| 9.083826787388888 | 2.75 |
| 9.086896685222223 | 2.94 |
| 9.089977139166667 | 3.17 |
| 9.093055093 | 2.84 |
| 9.096143047416668 | 3.09 |
| 9.099206555972222 | 2.53 |
| 9.102278676111112 | 2.88 |
| 9.105364408166666 | 2.88 |
| 9.108433472611111 | 2.89 |
| 9.111506148333333 | 2.87 |
| 9.114572712638887 | 3.02 |
| 9.117640388083334 | 2.93 |
| 9.120722786611111 | 3.14 |
| 9.123795184583333 | 2.95 |
| 9.126858415333334 | 2.83 |
| 9.12994164725 | 2.93 |
| 9.133012100638888 | 2.67 |
| 9.136073386833333 | 3.08 |
| 9.139156340972223 | 3.11 |
| 9.142219016138888 | 2.83 |
| 9.145301692444443 | 3.13 |
| 9.148374645999999 | 2.98 |
| 9.15144732175 | 3.02 |
| 9.154525553361111 | 2.94 |
| 9.157595451166667 | 2.96 |
| 9.16068368336111 | 2.69 |
| 9.163765526305557 | 2.88 |
| 9.166835146305555 | 2.68 |
| 9.169895043555554 | 3.14 |
| 9.172961330055557 | 2.95 |
| 9.176040395055557 | 3.08 |
| 9.179105292583333 | 2.53 |
| 9.182177412722222 | 3.02 |
| 9.185240921277778 | 3.03 |
| 9.188323875388889 | 3.07 |
| 9.191389328527778 | 2.99 |
| 9.194485338916667 | 2.88 |
| 9.197569959805556 | 2.79 |
| 9.20063763527778 | 2.71 |
| 9.203712811166668 | 2.74 |
| 9.20678770925 | 2.88 |
| 9.2098556625 | 2.85 |
| 9.212931116194444 | 2.89 |
| 9.216008514416666 | 2.88 |
| 9.219074245333333 | 2.92 |
| 9.222159699583333 | 3.16 |
| 9.225225430499998 | 2.75 |
| 9.22830616225 | 2.94 |
| 9.23137244875 | 2.89 |
| 9.234437068472221 | 2.57 |
| 9.237496965722222 | 3.14 |
| 9.24056186325 | 2.73 |
| 9.243648706472221 | 2.85 |
| 9.246719437666666 | 2.84 |
| 9.249792669000001 | 3.12 |
| 9.252880623388888 | 3.23 |
| 9.255942742972222 | 2.83 |
| 9.2590076405 | 2.65 |
| 9.26208253861111 | 2.88 |
| 9.265146880527777 | 2.65 |
| 9.268239279638887 | 3.03 |
| 9.271301954805555 | 3.08 |
| 9.274387964666667 | 3.04 |
| 9.27747314111111 | 2.89 |
| 9.280540816583333 | 2.95 |
| 9.283622659527778 | 2.76 |
| 9.286698668777777 | 2.82 |
| 9.289775789222222 | 2.77 |
| 9.292857909972222 | 2.48 |
| 9.295925307638889 | 2.91 |
| 9.299012428638889 | 2.64 |
| 9.30207704838889 | 2.84 |
| 9.305157224555554 | 2.67 |
| 9.308259902027778 | 2.91 |
| 9.311354245666665 | 2.84 |
| 9.314416643055557 | 2.73 |
| 9.317503764083334 | 2.68 |
| 9.320592274055555 | 2.76 |
| 9.323665783194445 | 2.67 |
| 9.326726235999999 | 2.55 |
| 9.329801689694444 | 2.62 |
| 9.332898255694444 | 2.5 |
| 9.335963153222222 | 2.56 |
| 9.339028328527778 | 2.73 |
| 9.342096281805556 | 2.84 |
| 9.345168124166667 | 2.99 |
| 9.348256078555554 | 2.77 |
| 9.351316809166665 | 2.88 |
| 9.35437976213889 | 2.66 |
| 9.357478272694445 | 2.48 |
| 9.360543448027778 | 2.94 |
| 9.363632513583333 | 2.86 |
| 9.366707689472223 | 2.84 |
| 9.369770642444445 | 2.91 |
| 9.372854985527779 | 2.59 |
| 9.3759179385 | 2.78 |
| 9.379009504222223 | 2.94 |
| 9.382097736416666 | 2.76 |
| 9.385169023194445 | 2.65 |
| 9.388233642916667 | 2.62 |
| 9.391294373527778 | 2.83 |
| 9.394362604583334 | 2.83 |
| 9.397444169722222 | 2.88 |
| 9.400509622833335 | 2.76 |
| 9.403586743277778 | 2.76 |
| 9.406655529916668 | 2.64 |
| 9.409741817555556 | 2.81 |
| 9.412838105777777 | 3.17 |
| 9.415907725777776 | 3.25 |
| 9.418985679611112 | 3.03 |
| 9.42205196611111 | 2.91 |
| 9.42511686363889 | 2.94 |
| 9.428200928916667 | 2.64 |
| 9.431288049944445 | 2.82 |
| 9.434356836583333 | 3.02 |
| 9.437441179666667 | 2.85 |
| 9.44051691113889 | 2.77 |
| 9.443608199055555 | 2.69 |
| 9.446669207472222 | 2.74 |
| 9.44973327161111 | 3 |
| 9.452810392055556 | 3.13 |
| 9.455879178694445 | 2.93 |
| 9.458961855 | 2.88 |
| 9.462031197222222 | 2.8 |
| 9.465113873555556 | 2.81 |
| 9.468202661333333 | 2.83 |
| 9.471280337361112 | 2.7 |
| 9.474352735305555 | 3.06 |
| 9.47741791063889 | 2.99 |
| 9.480490864166667 | 3.18 |
| 9.483560484194445 | 2.57 |
| 9.486684551777778 | 2.78 |
| 9.489758338694443 | 2.68 |
| 9.492854626888889 | 2.86 |
| 9.495919802222222 | 2.63 |
| 9.499031646861111 | 2.92 |
| 9.50209793336111 | 2.78 |
| 9.505171164694445 | 2.82 |
| 9.508262174833334 | 2.94 |
| 9.511359296416668 | 2.56 |
| 9.514446973027779 | 2.6 |
| 9.51751075936111 | 2.72 |
| 9.520577323666668 | 2.94 |
| 9.523659722194445 | 3.11 |
| 9.526732120138888 | 2.84 |
| 9.529796739861112 | 3.05 |
| 9.532874693694444 | 2.9 |
| 9.535960703527778 | 3.09 |
| 9.539042824277777 | 3.12 |
| 9.542142168194445 | 2.92 |
| 9.545225955694445 | 2.73 |
| 9.548289742055555 | 2.91 |
| 9.551389363777778 | 3.67 |
| 9.55448259625 | 2.88 |
| 9.557565272583332 | 3.02 |
| 9.56072239761111 | 3.02 |
| 9.563802018194444 | 3.06 |
| 9.566898584194446 | 3 |
| 9.569966537444444 | 2.92 |
| 9.573054769638889 | 2.77 |
| 9.576126889805556 | 3.03 |
| 9.57918900938889 | 2.96 |
| 9.582251684555557 | 2.97 |
| 9.585349083944445 | 3.26 |
| 9.588429537916666 | 3.51 |
| 9.5915011025 | 3.07 |
| 9.594596557305556 | 3.25 |
| 9.597667566305557 | 2.91 |
| 9.600730519277779 | 2.57 |
| 9.603807361916667 | 2.93 |
| 9.606903372333333 | 2.33 |
| 9.609994938055555 | 2.65 |
| 9.613071780694446 | 2.9 |
| 9.616161679666666 | 3.17 |
| 9.619232410861112 | 2.93 |
| 9.622309253500001 | 2.68 |
| 9.625376928972223 | 3.12 |
| 9.628436826194445 | 3.26 |
| 9.631500334750001 | 3.02 |
| 9.63457551063889 | 3.07 |
| 9.637674021194444 | 3.03 |
| 9.640741141083332 | 3.2 |
| 9.643819928277777 | 3.4 |
| 9.646889826083333 | 2.86 |
| 9.649956112583334 | 2.95 |
| 9.653035733166666 | 2.84 |
| 9.6561184095 | 2.97 |
| 9.659181362472223 | 2.78 |
| 9.662267372305555 | 2.71 |
| 9.665346159527779 | 2.79 |
| 9.668433836111111 | 3.06 |
| 9.671518457 | 3.01 |
| 9.674589743777778 | 2.84 |
| 9.67768380963889 | 3.32 |
| 9.680767041527776 | 2.6 |
| 9.683843884194443 | 3.03 |
| 9.686909615111112 | 2.92 |
| 9.689974234833333 | 2.68 |
| 9.693049410722223 | 2.54 |
| 9.696256816388889 | 2.66 |
| 9.699333659055556 | 2.89 |
| 9.702404668027777 | 3 |
| 9.705469565555555 | 2.9 |
| 9.70853140736111 | 2.84 |
| 9.711613528083333 | 2.84 |
| 9.714675092083334 | 2.64 |
| 9.717745545472221 | 2.82 |
| 9.720829888555555 | 2.5 |
| 9.723894786083333 | 2.77 |
| 9.726979962555555 | 2.98 |
| 9.730065416805555 | 3.04 |
| 9.733126980805554 | 2.99 |
| 9.736191044944444 | 2.9 |
| 9.73925288675 | 2.86 |
| 9.742315839722222 | 3.21 |
| 9.745390460000001 | 2.87 |
| 9.748453690777778 | 3.07 |
| 9.751559701749999 | 2.87 |
| 9.75463876675 | 2.67 |
| 9.757724776611111 | 2.72 |
| 9.760788840750001 | 2.93 |
| 9.763862627666667 | 3.02 |
| 9.766923913888888 | 2.73 |
| 9.770004090055556 | 2.85 |
| 9.773064265083333 | 3.02 |
| 9.776173887388888 | 2.91 |
| 9.779247396527778 | 2.75 |
| 9.782339240027778 | 2.71 |
| 9.785411360194445 | 2.83 |
| 9.788500703555556 | 2.83 |
| 9.791564212111112 | 3.21 |
| 9.794636332277777 | 3.01 |
| 9.797717619611111 | 2.85 |
| 9.800781405972222 | 2.83 |
| 9.803859637583333 | 2.9 |
| 9.806928424222221 | 2.7 |
| 9.809991099388888 | 3.14 |
| 9.813065164111112 | 2.67 |
| 9.816129783833334 | 2.89 |
| 9.8192066265 | 2.43 |
| 9.822285969305556 | 2.74 |
| 9.825370034583333 | 2.63 |
| 9.828432709749999 | 3.06 |
| 9.831496218305555 | 2.75 |
| 9.83456056025 | 2.95 |
| 9.837644625527778 | 2.98 |
| 9.840729246416668 | 2.74 |
| 9.843799977611111 | 3.06 |
| 9.846888209805556 | 2.87 |
| 9.849964774666665 | 2.85 |
| 9.853032727916666 | 2.91 |
| 9.856123182444444 | 3.07 |
| 9.859185024250001 | 3.08 |
| 9.86226492263889 | 3.16 |
| 9.865335098222221 | 3.18 |
| 9.868407496194443 | 3.16 |
| 9.871471560333333 | 3.03 |
| 9.874569793083333 | 2.79 |
| 9.877653024999999 | 2.52 |
| 9.880766536416665 | 3.18 |
| 9.883838656583332 | 3.29 |
| 9.886902442916668 | 2.87 |
| 9.889968729416667 | 2.97 |
| 9.893032793555555 | 2.85 |
| 9.896444377583332 | 2.88 |
| 9.899503719222222 | 3.08 |
| 9.90256306088889 | 3.03 |